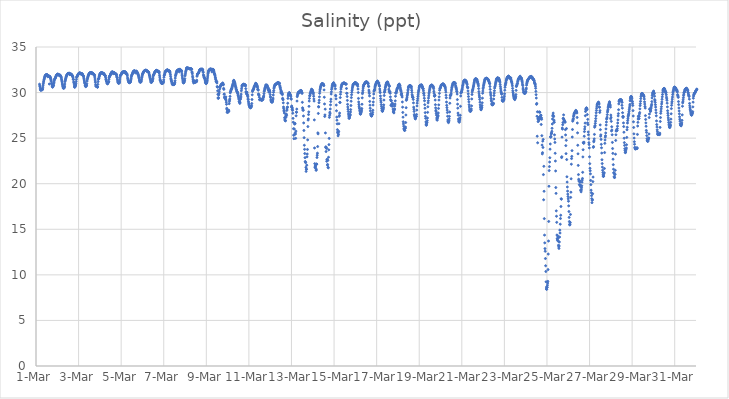
| Category | Salinity (ppt) |
|---|---|
| 44621.166666666664 | 30.92 |
| 44621.177083333336 | 30.74 |
| 44621.1875 | 30.64 |
| 44621.197916666664 | 30.49 |
| 44621.208333333336 | 30.33 |
| 44621.21875 | 30.26 |
| 44621.229166666664 | 30.3 |
| 44621.239583333336 | 30.27 |
| 44621.25 | 30.3 |
| 44621.260416666664 | 30.31 |
| 44621.270833333336 | 30.4 |
| 44621.28125 | 30.34 |
| 44621.291666666664 | 30.35 |
| 44621.302083333336 | 30.31 |
| 44621.3125 | 30.41 |
| 44621.322916666664 | 30.6 |
| 44621.333333333336 | 30.81 |
| 44621.34375 | 30.98 |
| 44621.354166666664 | 31.15 |
| 44621.364583333336 | 31.27 |
| 44621.375 | 31.4 |
| 44621.385416666664 | 31.49 |
| 44621.395833333336 | 31.59 |
| 44621.40625 | 31.69 |
| 44621.416666666664 | 31.77 |
| 44621.427083333336 | 31.82 |
| 44621.4375 | 31.86 |
| 44621.447916666664 | 31.91 |
| 44621.458333333336 | 31.93 |
| 44621.46875 | 31.94 |
| 44621.479166666664 | 31.95 |
| 44621.489583333336 | 31.95 |
| 44621.5 | 31.95 |
| 44621.510416666664 | 31.95 |
| 44621.520833333336 | 31.94 |
| 44621.53125 | 31.95 |
| 44621.541666666664 | 31.91 |
| 44621.552083333336 | 31.74 |
| 44621.5625 | 31.83 |
| 44621.572916666664 | 31.81 |
| 44621.583333333336 | 31.84 |
| 44621.59375 | 31.81 |
| 44621.604166666664 | 31.82 |
| 44621.614583333336 | 31.78 |
| 44621.625 | 30.94 |
| 44621.635416666664 | 31.79 |
| 44621.645833333336 | 31.76 |
| 44621.65625 | 31.74 |
| 44621.666666666664 | 31.67 |
| 44621.677083333336 | 31.61 |
| 44621.6875 | 31.55 |
| 44621.697916666664 | 31.44 |
| 44621.708333333336 | 31.35 |
| 44621.71875 | 31.22 |
| 44621.729166666664 | 31.01 |
| 44621.739583333336 | 30.99 |
| 44621.75 | 30.85 |
| 44621.760416666664 | 30.71 |
| 44621.770833333336 | 30.64 |
| 44621.78125 | 30.59 |
| 44621.791666666664 | 30.66 |
| 44621.802083333336 | 30.74 |
| 44621.8125 | 30.75 |
| 44621.822916666664 | 30.79 |
| 44621.833333333336 | 30.97 |
| 44621.84375 | 31.1 |
| 44621.854166666664 | 31.27 |
| 44621.864583333336 | 31.39 |
| 44621.875 | 31.46 |
| 44621.885416666664 | 31.5 |
| 44621.895833333336 | 31.56 |
| 44621.90625 | 31.6 |
| 44621.916666666664 | 31.65 |
| 44621.927083333336 | 31.72 |
| 44621.9375 | 31.76 |
| 44621.947916666664 | 31.83 |
| 44621.958333333336 | 31.88 |
| 44621.96875 | 31.92 |
| 44621.979166666664 | 31.95 |
| 44621.989583333336 | 31.98 |
| 44622.0 | 32 |
| 44622.010416666664 | 32.01 |
| 44622.020833333336 | 32.01 |
| 44622.03125 | 32.01 |
| 44622.041666666664 | 32.01 |
| 44622.052083333336 | 31.94 |
| 44622.0625 | 31.95 |
| 44622.072916666664 | 31.95 |
| 44622.083333333336 | 31.92 |
| 44622.09375 | 31.92 |
| 44622.104166666664 | 31.91 |
| 44622.114583333336 | 31.89 |
| 44622.125 | 31.91 |
| 44622.135416666664 | 31.91 |
| 44622.145833333336 | 31.85 |
| 44622.15625 | 31.81 |
| 44622.166666666664 | 31.76 |
| 44622.177083333336 | 31.72 |
| 44622.1875 | 31.63 |
| 44622.197916666664 | 31.48 |
| 44622.208333333336 | 31.36 |
| 44622.21875 | 31.22 |
| 44622.229166666664 | 31.06 |
| 44622.239583333336 | 30.92 |
| 44622.25 | 30.81 |
| 44622.260416666664 | 30.64 |
| 44622.270833333336 | 30.61 |
| 44622.28125 | 30.49 |
| 44622.291666666664 | 30.48 |
| 44622.302083333336 | 30.5 |
| 44622.3125 | 30.61 |
| 44622.322916666664 | 30.5 |
| 44622.333333333336 | 30.59 |
| 44622.34375 | 30.7 |
| 44622.354166666664 | 30.94 |
| 44622.364583333336 | 31.2 |
| 44622.375 | 31.33 |
| 44622.385416666664 | 31.44 |
| 44622.395833333336 | 31.55 |
| 44622.40625 | 31.64 |
| 44622.416666666664 | 31.73 |
| 44622.427083333336 | 31.8 |
| 44622.4375 | 31.86 |
| 44622.447916666664 | 31.92 |
| 44622.458333333336 | 31.97 |
| 44622.46875 | 32.01 |
| 44622.479166666664 | 32.04 |
| 44622.489583333336 | 32.07 |
| 44622.5 | 32.09 |
| 44622.510416666664 | 32.09 |
| 44622.520833333336 | 32.1 |
| 44622.53125 | 32.1 |
| 44622.541666666664 | 32.1 |
| 44622.552083333336 | 32.11 |
| 44622.5625 | 32.11 |
| 44622.572916666664 | 32.11 |
| 44622.583333333336 | 31.98 |
| 44622.59375 | 31.97 |
| 44622.604166666664 | 32.03 |
| 44622.614583333336 | 32.03 |
| 44622.625 | 32.01 |
| 44622.635416666664 | 32.04 |
| 44622.645833333336 | 32 |
| 44622.65625 | 32.02 |
| 44622.666666666664 | 31.97 |
| 44622.677083333336 | 31.96 |
| 44622.6875 | 31.93 |
| 44622.697916666664 | 31.86 |
| 44622.708333333336 | 31.84 |
| 44622.71875 | 31.8 |
| 44622.729166666664 | 31.73 |
| 44622.739583333336 | 31.62 |
| 44622.75 | 31.46 |
| 44622.760416666664 | 31.42 |
| 44622.770833333336 | 31.17 |
| 44622.78125 | 31.07 |
| 44622.791666666664 | 30.94 |
| 44622.802083333336 | 30.72 |
| 44622.8125 | 30.61 |
| 44622.822916666664 | 30.58 |
| 44622.833333333336 | 30.67 |
| 44622.84375 | 30.79 |
| 44622.854166666664 | 30.73 |
| 44622.864583333336 | 30.84 |
| 44622.875 | 30.98 |
| 44622.885416666664 | 31.2 |
| 44622.895833333336 | 31.43 |
| 44622.90625 | 31.64 |
| 44622.916666666664 | 31.73 |
| 44622.927083333336 | 31.77 |
| 44622.9375 | 31.81 |
| 44622.947916666664 | 31.87 |
| 44622.958333333336 | 31.9 |
| 44622.96875 | 31.94 |
| 44622.979166666664 | 32 |
| 44622.989583333336 | 32.05 |
| 44623.0 | 32.07 |
| 44623.010416666664 | 32.1 |
| 44623.020833333336 | 32.12 |
| 44623.03125 | 32.13 |
| 44623.041666666664 | 32.14 |
| 44623.052083333336 | 32.15 |
| 44623.0625 | 32.15 |
| 44623.072916666664 | 32.16 |
| 44623.083333333336 | 32.1 |
| 44623.09375 | 32.07 |
| 44623.104166666664 | 32.05 |
| 44623.114583333336 | 32.06 |
| 44623.125 | 32.09 |
| 44623.135416666664 | 32.04 |
| 44623.145833333336 | 32.02 |
| 44623.15625 | 32.07 |
| 44623.166666666664 | 32.05 |
| 44623.177083333336 | 32.06 |
| 44623.1875 | 31.92 |
| 44623.197916666664 | 31.89 |
| 44623.208333333336 | 31.88 |
| 44623.21875 | 31.87 |
| 44623.229166666664 | 31.81 |
| 44623.239583333336 | 31.7 |
| 44623.25 | 31.53 |
| 44623.260416666664 | 31.39 |
| 44623.270833333336 | 31.27 |
| 44623.28125 | 31.13 |
| 44623.291666666664 | 31.03 |
| 44623.302083333336 | 30.96 |
| 44623.3125 | 30.79 |
| 44623.322916666664 | 30.71 |
| 44623.333333333336 | 30.65 |
| 44623.34375 | 30.71 |
| 44623.354166666664 | 30.78 |
| 44623.364583333336 | 30.71 |
| 44623.375 | 30.81 |
| 44623.385416666664 | 30.97 |
| 44623.395833333336 | 31.25 |
| 44623.40625 | 31.4 |
| 44623.416666666664 | 31.53 |
| 44623.427083333336 | 31.64 |
| 44623.4375 | 31.73 |
| 44623.447916666664 | 31.8 |
| 44623.458333333336 | 31.88 |
| 44623.46875 | 31.94 |
| 44623.479166666664 | 31.99 |
| 44623.489583333336 | 32.05 |
| 44623.5 | 32.08 |
| 44623.510416666664 | 32.11 |
| 44623.520833333336 | 32.14 |
| 44623.53125 | 32.16 |
| 44623.541666666664 | 32.17 |
| 44623.552083333336 | 32.18 |
| 44623.5625 | 32.19 |
| 44623.572916666664 | 32.19 |
| 44623.583333333336 | 32.2 |
| 44623.59375 | 32.2 |
| 44623.604166666664 | 32.13 |
| 44623.614583333336 | 32.08 |
| 44623.625 | 32.15 |
| 44623.635416666664 | 32.14 |
| 44623.645833333336 | 32.13 |
| 44623.65625 | 32.11 |
| 44623.666666666664 | 32.13 |
| 44623.677083333336 | 32.08 |
| 44623.6875 | 32.04 |
| 44623.697916666664 | 32 |
| 44623.708333333336 | 31.98 |
| 44623.71875 | 31.98 |
| 44623.729166666664 | 31.99 |
| 44623.739583333336 | 31.95 |
| 44623.75 | 31.85 |
| 44623.760416666664 | 31.7 |
| 44623.770833333336 | 31.49 |
| 44623.78125 | 31.28 |
| 44623.791666666664 | 31.1 |
| 44623.802083333336 | 30.86 |
| 44623.8125 | 30.73 |
| 44623.822916666664 | 30.7 |
| 44623.833333333336 | 30.67 |
| 44623.84375 | 30.69 |
| 44623.854166666664 | 30.69 |
| 44623.864583333336 | 30.7 |
| 44623.875 | 30.63 |
| 44623.885416666664 | 30.58 |
| 44623.895833333336 | 30.62 |
| 44623.90625 | 30.9 |
| 44623.916666666664 | 31.2 |
| 44623.927083333336 | 31.44 |
| 44623.9375 | 31.52 |
| 44623.947916666664 | 31.56 |
| 44623.958333333336 | 31.61 |
| 44623.96875 | 31.76 |
| 44623.979166666664 | 31.85 |
| 44623.989583333336 | 31.95 |
| 44624.0 | 32.02 |
| 44624.010416666664 | 32.06 |
| 44624.020833333336 | 32.1 |
| 44624.03125 | 32.13 |
| 44624.041666666664 | 32.15 |
| 44624.052083333336 | 32.16 |
| 44624.0625 | 32.17 |
| 44624.072916666664 | 32.17 |
| 44624.083333333336 | 32.18 |
| 44624.09375 | 32.18 |
| 44624.104166666664 | 32.19 |
| 44624.114583333336 | 32.08 |
| 44624.125 | 32.12 |
| 44624.135416666664 | 32.1 |
| 44624.145833333336 | 32.09 |
| 44624.15625 | 32.09 |
| 44624.166666666664 | 32.1 |
| 44624.177083333336 | 32.11 |
| 44624.1875 | 32.07 |
| 44624.197916666664 | 32.03 |
| 44624.208333333336 | 31.98 |
| 44624.21875 | 31.94 |
| 44624.229166666664 | 31.91 |
| 44624.239583333336 | 31.89 |
| 44624.25 | 31.87 |
| 44624.260416666664 | 31.83 |
| 44624.270833333336 | 31.67 |
| 44624.28125 | 31.49 |
| 44624.291666666664 | 31.43 |
| 44624.302083333336 | 31.3 |
| 44624.3125 | 31.22 |
| 44624.322916666664 | 31.17 |
| 44624.333333333336 | 31.05 |
| 44624.34375 | 31.02 |
| 44624.354166666664 | 30.98 |
| 44624.364583333336 | 30.96 |
| 44624.375 | 31.09 |
| 44624.385416666664 | 31.05 |
| 44624.395833333336 | 31.11 |
| 44624.40625 | 31.16 |
| 44624.416666666664 | 31.22 |
| 44624.427083333336 | 31.46 |
| 44624.4375 | 31.64 |
| 44624.447916666664 | 31.72 |
| 44624.458333333336 | 31.79 |
| 44624.46875 | 31.84 |
| 44624.479166666664 | 31.85 |
| 44624.489583333336 | 31.91 |
| 44624.5 | 31.99 |
| 44624.510416666664 | 32.06 |
| 44624.520833333336 | 32.08 |
| 44624.53125 | 32.15 |
| 44624.541666666664 | 32.17 |
| 44624.552083333336 | 32.24 |
| 44624.5625 | 32.24 |
| 44624.572916666664 | 32.22 |
| 44624.583333333336 | 32.25 |
| 44624.59375 | 32.26 |
| 44624.604166666664 | 32.24 |
| 44624.614583333336 | 32.25 |
| 44624.625 | 32.07 |
| 44624.635416666664 | 32.15 |
| 44624.645833333336 | 32.19 |
| 44624.65625 | 32.19 |
| 44624.666666666664 | 32.16 |
| 44624.677083333336 | 32.16 |
| 44624.6875 | 32.17 |
| 44624.697916666664 | 32.13 |
| 44624.708333333336 | 32.11 |
| 44624.71875 | 32.1 |
| 44624.729166666664 | 32.05 |
| 44624.739583333336 | 32.04 |
| 44624.75 | 32.05 |
| 44624.760416666664 | 32.02 |
| 44624.770833333336 | 32.01 |
| 44624.78125 | 31.96 |
| 44624.791666666664 | 31.79 |
| 44624.802083333336 | 31.69 |
| 44624.8125 | 31.64 |
| 44624.822916666664 | 31.46 |
| 44624.833333333336 | 31.29 |
| 44624.84375 | 31.17 |
| 44624.854166666664 | 31.1 |
| 44624.864583333336 | 31.05 |
| 44624.875 | 31.03 |
| 44624.885416666664 | 31.03 |
| 44624.895833333336 | 31.18 |
| 44624.90625 | 31.04 |
| 44624.916666666664 | 31.09 |
| 44624.927083333336 | 31.19 |
| 44624.9375 | 31.39 |
| 44624.947916666664 | 31.61 |
| 44624.958333333336 | 31.83 |
| 44624.96875 | 31.89 |
| 44624.979166666664 | 31.9 |
| 44624.989583333336 | 31.94 |
| 44625.0 | 32.01 |
| 44625.010416666664 | 32.02 |
| 44625.020833333336 | 32.09 |
| 44625.03125 | 32.14 |
| 44625.041666666664 | 32.18 |
| 44625.052083333336 | 32.2 |
| 44625.0625 | 32.22 |
| 44625.072916666664 | 32.24 |
| 44625.083333333336 | 32.26 |
| 44625.09375 | 32.27 |
| 44625.104166666664 | 32.28 |
| 44625.114583333336 | 32.29 |
| 44625.125 | 32.29 |
| 44625.135416666664 | 32.28 |
| 44625.145833333336 | 32.29 |
| 44625.15625 | 32.18 |
| 44625.166666666664 | 32.21 |
| 44625.177083333336 | 32.29 |
| 44625.1875 | 32.26 |
| 44625.197916666664 | 32.24 |
| 44625.208333333336 | 32.23 |
| 44625.21875 | 32.18 |
| 44625.229166666664 | 32.11 |
| 44625.239583333336 | 32.05 |
| 44625.25 | 32.04 |
| 44625.260416666664 | 32.08 |
| 44625.270833333336 | 32.03 |
| 44625.28125 | 31.95 |
| 44625.291666666664 | 31.83 |
| 44625.302083333336 | 31.61 |
| 44625.3125 | 31.5 |
| 44625.322916666664 | 31.39 |
| 44625.333333333336 | 31.31 |
| 44625.34375 | 31.23 |
| 44625.354166666664 | 31.17 |
| 44625.364583333336 | 31.13 |
| 44625.375 | 31.07 |
| 44625.385416666664 | 31.09 |
| 44625.395833333336 | 31.11 |
| 44625.40625 | 31.17 |
| 44625.416666666664 | 31.12 |
| 44625.427083333336 | 31.14 |
| 44625.4375 | 31.19 |
| 44625.447916666664 | 31.29 |
| 44625.458333333336 | 31.41 |
| 44625.46875 | 31.57 |
| 44625.479166666664 | 31.73 |
| 44625.489583333336 | 31.84 |
| 44625.5 | 31.92 |
| 44625.510416666664 | 31.97 |
| 44625.520833333336 | 32.03 |
| 44625.53125 | 32.09 |
| 44625.541666666664 | 32.14 |
| 44625.552083333336 | 32.21 |
| 44625.5625 | 32.26 |
| 44625.572916666664 | 32.3 |
| 44625.583333333336 | 32.33 |
| 44625.59375 | 32.35 |
| 44625.604166666664 | 32.37 |
| 44625.614583333336 | 32.38 |
| 44625.625 | 32.38 |
| 44625.635416666664 | 32.37 |
| 44625.645833333336 | 32.36 |
| 44625.65625 | 32.32 |
| 44625.666666666664 | 32.16 |
| 44625.677083333336 | 32.3 |
| 44625.6875 | 32.33 |
| 44625.697916666664 | 32.33 |
| 44625.708333333336 | 32.35 |
| 44625.71875 | 32.33 |
| 44625.729166666664 | 32.31 |
| 44625.739583333336 | 32.27 |
| 44625.75 | 32.21 |
| 44625.760416666664 | 32.18 |
| 44625.770833333336 | 32.09 |
| 44625.78125 | 32.08 |
| 44625.791666666664 | 32 |
| 44625.802083333336 | 31.93 |
| 44625.8125 | 31.88 |
| 44625.822916666664 | 31.75 |
| 44625.833333333336 | 31.64 |
| 44625.84375 | 31.56 |
| 44625.854166666664 | 31.38 |
| 44625.864583333336 | 31.36 |
| 44625.875 | 31.19 |
| 44625.885416666664 | 31.19 |
| 44625.895833333336 | 31.13 |
| 44625.90625 | 31.14 |
| 44625.916666666664 | 31.27 |
| 44625.927083333336 | 31.18 |
| 44625.9375 | 31.18 |
| 44625.947916666664 | 31.3 |
| 44625.958333333336 | 31.46 |
| 44625.96875 | 31.63 |
| 44625.979166666664 | 31.74 |
| 44625.989583333336 | 31.89 |
| 44626.0 | 32 |
| 44626.010416666664 | 32.05 |
| 44626.020833333336 | 32.1 |
| 44626.03125 | 32.16 |
| 44626.041666666664 | 32.2 |
| 44626.052083333336 | 32.25 |
| 44626.0625 | 32.3 |
| 44626.072916666664 | 32.34 |
| 44626.083333333336 | 32.37 |
| 44626.09375 | 32.39 |
| 44626.104166666664 | 32.41 |
| 44626.114583333336 | 32.42 |
| 44626.125 | 32.43 |
| 44626.135416666664 | 32.43 |
| 44626.145833333336 | 32.44 |
| 44626.15625 | 32.45 |
| 44626.166666666664 | 32.46 |
| 44626.177083333336 | 32.44 |
| 44626.1875 | 32.37 |
| 44626.197916666664 | 32.36 |
| 44626.208333333336 | 32.35 |
| 44626.21875 | 32.37 |
| 44626.229166666664 | 32.37 |
| 44626.239583333336 | 32.35 |
| 44626.25 | 32.34 |
| 44626.260416666664 | 32.31 |
| 44626.270833333336 | 32.29 |
| 44626.28125 | 32.24 |
| 44626.291666666664 | 32.21 |
| 44626.302083333336 | 32.15 |
| 44626.3125 | 32.04 |
| 44626.322916666664 | 31.93 |
| 44626.333333333336 | 31.88 |
| 44626.34375 | 31.74 |
| 44626.354166666664 | 31.64 |
| 44626.364583333336 | 31.52 |
| 44626.375 | 31.45 |
| 44626.385416666664 | 31.3 |
| 44626.395833333336 | 31.2 |
| 44626.40625 | 31.12 |
| 44626.416666666664 | 31.12 |
| 44626.427083333336 | 31.12 |
| 44626.4375 | 31.21 |
| 44626.447916666664 | 31.2 |
| 44626.458333333336 | 31.24 |
| 44626.46875 | 31.32 |
| 44626.479166666664 | 31.44 |
| 44626.489583333336 | 31.54 |
| 44626.5 | 31.72 |
| 44626.510416666664 | 31.88 |
| 44626.520833333336 | 31.92 |
| 44626.53125 | 31.95 |
| 44626.541666666664 | 32.02 |
| 44626.552083333336 | 32.09 |
| 44626.5625 | 32.15 |
| 44626.572916666664 | 32.21 |
| 44626.583333333336 | 32.25 |
| 44626.59375 | 32.29 |
| 44626.604166666664 | 32.32 |
| 44626.614583333336 | 32.36 |
| 44626.625 | 32.38 |
| 44626.635416666664 | 32.4 |
| 44626.645833333336 | 32.42 |
| 44626.65625 | 32.43 |
| 44626.666666666664 | 32.44 |
| 44626.677083333336 | 32.36 |
| 44626.6875 | 32.37 |
| 44626.697916666664 | 32.34 |
| 44626.708333333336 | 32.34 |
| 44626.71875 | 32.36 |
| 44626.729166666664 | 32.34 |
| 44626.739583333336 | 32.35 |
| 44626.75 | 32.32 |
| 44626.760416666664 | 32.23 |
| 44626.770833333336 | 32.3 |
| 44626.78125 | 32.27 |
| 44626.791666666664 | 32.15 |
| 44626.802083333336 | 31.91 |
| 44626.8125 | 31.7 |
| 44626.822916666664 | 31.48 |
| 44626.833333333336 | 31.36 |
| 44626.84375 | 31.33 |
| 44626.854166666664 | 31.27 |
| 44626.864583333336 | 31.16 |
| 44626.875 | 31.13 |
| 44626.885416666664 | 31.03 |
| 44626.895833333336 | 31.02 |
| 44626.90625 | 31.02 |
| 44626.916666666664 | 31.02 |
| 44626.927083333336 | 31.02 |
| 44626.9375 | 31.04 |
| 44626.947916666664 | 31.07 |
| 44626.958333333336 | 31.02 |
| 44626.96875 | 31.06 |
| 44626.979166666664 | 31.13 |
| 44626.989583333336 | 31.2 |
| 44627.0 | 31.39 |
| 44627.010416666664 | 31.68 |
| 44627.020833333336 | 31.87 |
| 44627.03125 | 31.94 |
| 44627.041666666664 | 32.01 |
| 44627.052083333336 | 32.13 |
| 44627.0625 | 32.22 |
| 44627.072916666664 | 32.29 |
| 44627.083333333336 | 32.33 |
| 44627.09375 | 32.35 |
| 44627.104166666664 | 32.37 |
| 44627.114583333336 | 32.39 |
| 44627.125 | 32.41 |
| 44627.135416666664 | 32.44 |
| 44627.145833333336 | 32.46 |
| 44627.15625 | 32.47 |
| 44627.166666666664 | 32.48 |
| 44627.177083333336 | 32.48 |
| 44627.1875 | 32.48 |
| 44627.197916666664 | 32.45 |
| 44627.208333333336 | 32.37 |
| 44627.21875 | 32.39 |
| 44627.229166666664 | 32.36 |
| 44627.239583333336 | 32.37 |
| 44627.25 | 32.37 |
| 44627.260416666664 | 32.38 |
| 44627.270833333336 | 32.36 |
| 44627.28125 | 32.34 |
| 44627.291666666664 | 32.26 |
| 44627.302083333336 | 32.14 |
| 44627.3125 | 31.97 |
| 44627.322916666664 | 31.78 |
| 44627.333333333336 | 31.57 |
| 44627.34375 | 31.45 |
| 44627.354166666664 | 31.36 |
| 44627.364583333336 | 31.25 |
| 44627.375 | 31.17 |
| 44627.385416666664 | 31.06 |
| 44627.395833333336 | 30.97 |
| 44627.40625 | 30.9 |
| 44627.416666666664 | 30.88 |
| 44627.427083333336 | 30.88 |
| 44627.4375 | 30.88 |
| 44627.447916666664 | 30.87 |
| 44627.458333333336 | 30.89 |
| 44627.46875 | 30.92 |
| 44627.479166666664 | 30.9 |
| 44627.489583333336 | 30.89 |
| 44627.5 | 30.94 |
| 44627.510416666664 | 31.02 |
| 44627.520833333336 | 31.13 |
| 44627.53125 | 31.3 |
| 44627.541666666664 | 31.59 |
| 44627.552083333336 | 31.83 |
| 44627.5625 | 31.92 |
| 44627.572916666664 | 32 |
| 44627.583333333336 | 32.09 |
| 44627.59375 | 32.19 |
| 44627.604166666664 | 32.28 |
| 44627.614583333336 | 32.35 |
| 44627.625 | 32.4 |
| 44627.635416666664 | 32.41 |
| 44627.645833333336 | 32.43 |
| 44627.65625 | 32.45 |
| 44627.666666666664 | 32.47 |
| 44627.677083333336 | 32.48 |
| 44627.6875 | 32.49 |
| 44627.697916666664 | 32.5 |
| 44627.708333333336 | 32.53 |
| 44627.71875 | 32.5 |
| 44627.729166666664 | 32.27 |
| 44627.739583333336 | 32.42 |
| 44627.75 | 32.44 |
| 44627.760416666664 | 32.57 |
| 44627.770833333336 | 32.49 |
| 44627.78125 | 32.49 |
| 44627.791666666664 | 32.44 |
| 44627.802083333336 | 32.45 |
| 44627.8125 | 32.45 |
| 44627.822916666664 | 32.42 |
| 44627.833333333336 | 32.39 |
| 44627.84375 | 32.27 |
| 44627.854166666664 | 32.04 |
| 44627.864583333336 | 31.86 |
| 44627.875 | 31.7 |
| 44627.885416666664 | 31.52 |
| 44627.895833333336 | 31.37 |
| 44627.90625 | 31.19 |
| 44627.916666666664 | 31.1 |
| 44627.927083333336 | 31.07 |
| 44627.9375 | 31.07 |
| 44627.947916666664 | 31.1 |
| 44627.958333333336 | 31.16 |
| 44627.96875 | 31.25 |
| 44627.979166666664 | 31.34 |
| 44627.989583333336 | 31.52 |
| 44628.0 | 31.83 |
| 44628.010416666664 | 31.95 |
| 44628.020833333336 | 32.13 |
| 44628.03125 | 32.28 |
| 44628.041666666664 | 32.38 |
| 44628.052083333336 | 32.47 |
| 44628.0625 | 32.59 |
| 44628.072916666664 | 32.7 |
| 44628.083333333336 | 32.71 |
| 44628.09375 | 32.7 |
| 44628.104166666664 | 32.69 |
| 44628.114583333336 | 32.69 |
| 44628.125 | 32.68 |
| 44628.135416666664 | 32.68 |
| 44628.145833333336 | 32.67 |
| 44628.15625 | 32.67 |
| 44628.166666666664 | 32.66 |
| 44628.177083333336 | 32.65 |
| 44628.1875 | 32.64 |
| 44628.197916666664 | 32.64 |
| 44628.208333333336 | 32.63 |
| 44628.21875 | 32.63 |
| 44628.229166666664 | 32.59 |
| 44628.239583333336 | 32.59 |
| 44628.25 | 32.6 |
| 44628.260416666664 | 32.6 |
| 44628.270833333336 | 32.61 |
| 44628.28125 | 32.6 |
| 44628.291666666664 | 32.6 |
| 44628.302083333336 | 32.6 |
| 44628.3125 | 32.54 |
| 44628.322916666664 | 32.27 |
| 44628.333333333336 | 32.22 |
| 44628.34375 | 32.06 |
| 44628.354166666664 | 31.8 |
| 44628.364583333336 | 31.62 |
| 44628.375 | 31.4 |
| 44628.385416666664 | 31.25 |
| 44628.395833333336 | 31.21 |
| 44628.40625 | 31.05 |
| 44628.416666666664 | 31.08 |
| 44628.427083333336 | 31.18 |
| 44628.4375 | 31.2 |
| 44628.447916666664 | 31.25 |
| 44628.458333333336 | 31.28 |
| 44628.46875 | 31.19 |
| 44628.479166666664 | 31.16 |
| 44628.489583333336 | 31.14 |
| 44628.5 | 31.14 |
| 44628.510416666664 | 31.2 |
| 44628.520833333336 | 31.21 |
| 44628.53125 | 31.22 |
| 44628.541666666664 | 31.2 |
| 44628.552083333336 | 31.36 |
| 44628.5625 | 31.79 |
| 44628.572916666664 | 31.91 |
| 44628.583333333336 | 32.02 |
| 44628.59375 | 32.07 |
| 44628.604166666664 | 32.08 |
| 44628.614583333336 | 32.1 |
| 44628.625 | 32.1 |
| 44628.635416666664 | 32.15 |
| 44628.645833333336 | 32.21 |
| 44628.65625 | 32.29 |
| 44628.666666666664 | 32.35 |
| 44628.677083333336 | 32.41 |
| 44628.6875 | 32.48 |
| 44628.697916666664 | 32.51 |
| 44628.708333333336 | 32.53 |
| 44628.71875 | 32.54 |
| 44628.729166666664 | 32.55 |
| 44628.739583333336 | 32.56 |
| 44628.75 | 32.53 |
| 44628.760416666664 | 32.51 |
| 44628.770833333336 | 32.53 |
| 44628.78125 | 32.57 |
| 44628.791666666664 | 32.57 |
| 44628.802083333336 | 32.57 |
| 44628.8125 | 32.55 |
| 44628.822916666664 | 32.54 |
| 44628.833333333336 | 32.49 |
| 44628.84375 | 32.34 |
| 44628.854166666664 | 32.2 |
| 44628.864583333336 | 31.94 |
| 44628.875 | 31.87 |
| 44628.885416666664 | 31.75 |
| 44628.895833333336 | 31.69 |
| 44628.90625 | 31.63 |
| 44628.916666666664 | 31.57 |
| 44628.927083333336 | 31.52 |
| 44628.9375 | 31.39 |
| 44628.947916666664 | 31.27 |
| 44628.958333333336 | 31.13 |
| 44628.96875 | 31.08 |
| 44628.979166666664 | 31.04 |
| 44628.989583333336 | 31 |
| 44629.0 | 30.99 |
| 44629.010416666664 | 31.06 |
| 44629.020833333336 | 31.13 |
| 44629.03125 | 31.19 |
| 44629.041666666664 | 31.31 |
| 44629.052083333336 | 31.5 |
| 44629.0625 | 31.71 |
| 44629.072916666664 | 31.92 |
| 44629.083333333336 | 32.11 |
| 44629.09375 | 32.23 |
| 44629.104166666664 | 32.35 |
| 44629.114583333336 | 32.41 |
| 44629.125 | 32.45 |
| 44629.135416666664 | 32.49 |
| 44629.145833333336 | 32.51 |
| 44629.15625 | 32.55 |
| 44629.166666666664 | 32.56 |
| 44629.177083333336 | 32.56 |
| 44629.1875 | 32.56 |
| 44629.197916666664 | 32.57 |
| 44629.208333333336 | 32.57 |
| 44629.21875 | 32.58 |
| 44629.229166666664 | 32.57 |
| 44629.239583333336 | 32.52 |
| 44629.25 | 32.53 |
| 44629.260416666664 | 32.28 |
| 44629.270833333336 | 32.5 |
| 44629.28125 | 32.53 |
| 44629.291666666664 | 32.54 |
| 44629.302083333336 | 32.53 |
| 44629.3125 | 32.53 |
| 44629.322916666664 | 32.54 |
| 44629.333333333336 | 32.49 |
| 44629.34375 | 32.43 |
| 44629.354166666664 | 32.33 |
| 44629.364583333336 | 32.2 |
| 44629.375 | 32.09 |
| 44629.385416666664 | 32.04 |
| 44629.395833333336 | 31.97 |
| 44629.40625 | 31.87 |
| 44629.416666666664 | 31.71 |
| 44629.427083333336 | 31.62 |
| 44629.4375 | 31.48 |
| 44629.447916666664 | 31.39 |
| 44629.458333333336 | 31.21 |
| 44629.46875 | 31.27 |
| 44629.479166666664 | 31.18 |
| 44629.489583333336 | 31.2 |
| 44629.5 | 31.05 |
| 44629.510416666664 | 30.66 |
| 44629.520833333336 | 30.59 |
| 44629.53125 | 30.19 |
| 44629.541666666664 | 29.81 |
| 44629.552083333336 | 29.42 |
| 44629.5625 | 29.36 |
| 44629.572916666664 | 29.44 |
| 44629.583333333336 | 29.74 |
| 44629.59375 | 29.89 |
| 44629.604166666664 | 30.08 |
| 44629.614583333336 | 30.32 |
| 44629.625 | 30.63 |
| 44629.635416666664 | 30.65 |
| 44629.645833333336 | 30.51 |
| 44629.65625 | 30.67 |
| 44629.666666666664 | 30.7 |
| 44629.677083333336 | 30.79 |
| 44629.6875 | 30.82 |
| 44629.697916666664 | 30.88 |
| 44629.708333333336 | 30.9 |
| 44629.71875 | 30.9 |
| 44629.729166666664 | 30.91 |
| 44629.739583333336 | 30.94 |
| 44629.75 | 30.92 |
| 44629.760416666664 | 31 |
| 44629.770833333336 | 31.06 |
| 44629.78125 | 30.97 |
| 44629.791666666664 | 30.84 |
| 44629.802083333336 | 30.89 |
| 44629.8125 | 30.46 |
| 44629.822916666664 | 30.35 |
| 44629.833333333336 | 29.81 |
| 44629.84375 | 29.84 |
| 44629.854166666664 | 29.51 |
| 44629.864583333336 | 29.47 |
| 44629.875 | 29.37 |
| 44629.885416666664 | 29.37 |
| 44629.895833333336 | 29.46 |
| 44629.90625 | 29.27 |
| 44629.916666666664 | 29.53 |
| 44629.927083333336 | 29.17 |
| 44629.9375 | 28.95 |
| 44629.947916666664 | 28.71 |
| 44629.958333333336 | 28.28 |
| 44629.96875 | 28.15 |
| 44629.979166666664 | 27.82 |
| 44629.989583333336 | 27.92 |
| 44630.0 | 28.04 |
| 44630.010416666664 | 27.86 |
| 44630.020833333336 | 27.85 |
| 44630.03125 | 27.97 |
| 44630.041666666664 | 27.96 |
| 44630.052083333336 | 28.08 |
| 44630.0625 | 27.97 |
| 44630.072916666664 | 28.78 |
| 44630.083333333336 | 29.02 |
| 44630.09375 | 29.18 |
| 44630.104166666664 | 29.3 |
| 44630.114583333336 | 29.58 |
| 44630.125 | 29.97 |
| 44630.135416666664 | 30.09 |
| 44630.145833333336 | 30.16 |
| 44630.15625 | 30.23 |
| 44630.166666666664 | 30.33 |
| 44630.177083333336 | 30.37 |
| 44630.1875 | 30.4 |
| 44630.197916666664 | 30.47 |
| 44630.208333333336 | 30.56 |
| 44630.21875 | 30.67 |
| 44630.229166666664 | 30.76 |
| 44630.239583333336 | 30.85 |
| 44630.25 | 30.94 |
| 44630.260416666664 | 31.03 |
| 44630.270833333336 | 31.2 |
| 44630.28125 | 31.31 |
| 44630.291666666664 | 31.35 |
| 44630.302083333336 | 31.27 |
| 44630.3125 | 31.19 |
| 44630.322916666664 | 31.14 |
| 44630.333333333336 | 31.08 |
| 44630.34375 | 30.99 |
| 44630.354166666664 | 30.89 |
| 44630.364583333336 | 30.74 |
| 44630.375 | 30.67 |
| 44630.385416666664 | 30.52 |
| 44630.395833333336 | 30.5 |
| 44630.40625 | 30.35 |
| 44630.416666666664 | 30.32 |
| 44630.427083333336 | 30.18 |
| 44630.4375 | 30.09 |
| 44630.447916666664 | 30.1 |
| 44630.458333333336 | 30.04 |
| 44630.46875 | 29.97 |
| 44630.479166666664 | 29.88 |
| 44630.489583333336 | 29.74 |
| 44630.5 | 29.66 |
| 44630.510416666664 | 29.53 |
| 44630.520833333336 | 29.39 |
| 44630.53125 | 29.24 |
| 44630.541666666664 | 29.01 |
| 44630.552083333336 | 28.97 |
| 44630.5625 | 28.98 |
| 44630.572916666664 | 28.81 |
| 44630.583333333336 | 28.93 |
| 44630.59375 | 29.23 |
| 44630.604166666664 | 29.31 |
| 44630.614583333336 | 29.45 |
| 44630.625 | 29.61 |
| 44630.635416666664 | 29.83 |
| 44630.645833333336 | 30.2 |
| 44630.65625 | 30.41 |
| 44630.666666666664 | 30.61 |
| 44630.677083333336 | 30.76 |
| 44630.6875 | 30.81 |
| 44630.697916666664 | 30.86 |
| 44630.708333333336 | 30.83 |
| 44630.71875 | 30.85 |
| 44630.729166666664 | 30.83 |
| 44630.739583333336 | 30.84 |
| 44630.75 | 30.89 |
| 44630.760416666664 | 30.94 |
| 44630.770833333336 | 30.85 |
| 44630.78125 | 30.84 |
| 44630.791666666664 | 30.86 |
| 44630.802083333336 | 30.85 |
| 44630.8125 | 30.86 |
| 44630.822916666664 | 30.85 |
| 44630.833333333336 | 30.82 |
| 44630.84375 | 30.73 |
| 44630.854166666664 | 30.43 |
| 44630.864583333336 | 30.11 |
| 44630.875 | 30 |
| 44630.885416666664 | 29.86 |
| 44630.895833333336 | 30.03 |
| 44630.90625 | 30.03 |
| 44630.916666666664 | 29.83 |
| 44630.927083333336 | 29.77 |
| 44630.9375 | 29.66 |
| 44630.947916666664 | 29.54 |
| 44630.958333333336 | 29.3 |
| 44630.96875 | 29.22 |
| 44630.979166666664 | 29 |
| 44630.989583333336 | 28.84 |
| 44631.0 | 28.69 |
| 44631.010416666664 | 28.6 |
| 44631.020833333336 | 28.52 |
| 44631.03125 | 28.46 |
| 44631.041666666664 | 28.43 |
| 44631.052083333336 | 28.4 |
| 44631.0625 | 28.39 |
| 44631.072916666664 | 28.34 |
| 44631.083333333336 | 28.33 |
| 44631.09375 | 28.42 |
| 44631.104166666664 | 28.43 |
| 44631.114583333336 | 28.44 |
| 44631.125 | 28.58 |
| 44631.135416666664 | 28.8 |
| 44631.145833333336 | 29.24 |
| 44631.15625 | 29.75 |
| 44631.166666666664 | 30.12 |
| 44631.177083333336 | 30.21 |
| 44631.1875 | 30.27 |
| 44631.197916666664 | 30.29 |
| 44631.208333333336 | 30.34 |
| 44631.21875 | 30.38 |
| 44631.229166666664 | 30.48 |
| 44631.239583333336 | 30.57 |
| 44631.25 | 30.63 |
| 44631.260416666664 | 30.67 |
| 44631.270833333336 | 30.73 |
| 44631.28125 | 30.76 |
| 44631.291666666664 | 30.84 |
| 44631.302083333336 | 30.91 |
| 44631.3125 | 31.01 |
| 44631.322916666664 | 31.01 |
| 44631.333333333336 | 31 |
| 44631.34375 | 30.91 |
| 44631.354166666664 | 30.87 |
| 44631.364583333336 | 30.88 |
| 44631.375 | 30.79 |
| 44631.385416666664 | 30.68 |
| 44631.395833333336 | 30.7 |
| 44631.40625 | 30.55 |
| 44631.416666666664 | 30.36 |
| 44631.427083333336 | 30.32 |
| 44631.4375 | 30.26 |
| 44631.447916666664 | 29.85 |
| 44631.458333333336 | 29.76 |
| 44631.46875 | 29.72 |
| 44631.479166666664 | 29.73 |
| 44631.489583333336 | 29.49 |
| 44631.5 | 29.22 |
| 44631.510416666664 | 29.25 |
| 44631.520833333336 | 29.2 |
| 44631.53125 | 29.22 |
| 44631.541666666664 | 29.25 |
| 44631.552083333336 | 29.27 |
| 44631.5625 | 29.23 |
| 44631.572916666664 | 29.18 |
| 44631.583333333336 | 29.2 |
| 44631.59375 | 29.19 |
| 44631.604166666664 | 29.17 |
| 44631.614583333336 | 29.16 |
| 44631.625 | 29.22 |
| 44631.635416666664 | 29.2 |
| 44631.645833333336 | 29.25 |
| 44631.65625 | 29.26 |
| 44631.666666666664 | 29.41 |
| 44631.677083333336 | 29.44 |
| 44631.6875 | 29.56 |
| 44631.697916666664 | 29.63 |
| 44631.708333333336 | 29.88 |
| 44631.71875 | 30.13 |
| 44631.729166666664 | 30.22 |
| 44631.739583333336 | 30.39 |
| 44631.75 | 30.39 |
| 44631.760416666664 | 30.57 |
| 44631.770833333336 | 30.6 |
| 44631.78125 | 30.6 |
| 44631.791666666664 | 30.8 |
| 44631.802083333336 | 30.85 |
| 44631.8125 | 30.75 |
| 44631.822916666664 | 30.61 |
| 44631.833333333336 | 30.78 |
| 44631.84375 | 30.84 |
| 44631.854166666664 | 30.74 |
| 44631.864583333336 | 30.58 |
| 44631.875 | 30.69 |
| 44631.885416666664 | 30.58 |
| 44631.895833333336 | 30.41 |
| 44631.90625 | 30.3 |
| 44631.916666666664 | 30.48 |
| 44631.927083333336 | 30.21 |
| 44631.9375 | 30.05 |
| 44631.947916666664 | 30.24 |
| 44631.958333333336 | 30.16 |
| 44631.96875 | 30.28 |
| 44631.979166666664 | 30.15 |
| 44631.989583333336 | 30.02 |
| 44632.0 | 29.77 |
| 44632.010416666664 | 29.55 |
| 44632.020833333336 | 29.45 |
| 44632.03125 | 29.21 |
| 44632.041666666664 | 29.13 |
| 44632.052083333336 | 29.02 |
| 44632.0625 | 28.99 |
| 44632.072916666664 | 28.96 |
| 44632.083333333336 | 28.97 |
| 44632.09375 | 28.97 |
| 44632.104166666664 | 28.98 |
| 44632.114583333336 | 29.09 |
| 44632.125 | 29.22 |
| 44632.135416666664 | 29.39 |
| 44632.145833333336 | 29.73 |
| 44632.15625 | 30.03 |
| 44632.166666666664 | 30.23 |
| 44632.177083333336 | 30.47 |
| 44632.1875 | 30.59 |
| 44632.197916666664 | 30.66 |
| 44632.208333333336 | 30.75 |
| 44632.21875 | 30.81 |
| 44632.229166666664 | 30.86 |
| 44632.239583333336 | 30.88 |
| 44632.25 | 30.9 |
| 44632.260416666664 | 30.89 |
| 44632.270833333336 | 30.91 |
| 44632.28125 | 30.96 |
| 44632.291666666664 | 30.96 |
| 44632.302083333336 | 30.99 |
| 44632.3125 | 31.03 |
| 44632.322916666664 | 31.04 |
| 44632.333333333336 | 31.04 |
| 44632.34375 | 31.04 |
| 44632.354166666664 | 31.06 |
| 44632.364583333336 | 31.07 |
| 44632.375 | 31.08 |
| 44632.385416666664 | 31.09 |
| 44632.395833333336 | 31.03 |
| 44632.40625 | 31.04 |
| 44632.416666666664 | 31.01 |
| 44632.427083333336 | 31.02 |
| 44632.4375 | 31.02 |
| 44632.447916666664 | 30.79 |
| 44632.458333333336 | 30.69 |
| 44632.46875 | 30.57 |
| 44632.479166666664 | 30.48 |
| 44632.489583333336 | 30.31 |
| 44632.5 | 30.07 |
| 44632.510416666664 | 29.93 |
| 44632.520833333336 | 30.18 |
| 44632.53125 | 30.05 |
| 44632.541666666664 | 30.01 |
| 44632.552083333336 | 29.9 |
| 44632.5625 | 29.88 |
| 44632.572916666664 | 29.77 |
| 44632.583333333336 | 29.37 |
| 44632.59375 | 29.29 |
| 44632.604166666664 | 29.21 |
| 44632.614583333336 | 28.87 |
| 44632.625 | 28.42 |
| 44632.635416666664 | 28.24 |
| 44632.645833333336 | 28.05 |
| 44632.65625 | 27.91 |
| 44632.666666666664 | 27.75 |
| 44632.677083333336 | 27.25 |
| 44632.6875 | 27 |
| 44632.697916666664 | 27.11 |
| 44632.708333333336 | 26.91 |
| 44632.71875 | 26.91 |
| 44632.729166666664 | 27.43 |
| 44632.739583333336 | 27.3 |
| 44632.75 | 27.61 |
| 44632.760416666664 | 27.63 |
| 44632.770833333336 | 27.48 |
| 44632.78125 | 28.04 |
| 44632.791666666664 | 28.19 |
| 44632.802083333336 | 28.37 |
| 44632.8125 | 28.42 |
| 44632.822916666664 | 28.83 |
| 44632.833333333336 | 29.36 |
| 44632.84375 | 29.63 |
| 44632.854166666664 | 29.76 |
| 44632.864583333336 | 29.87 |
| 44632.875 | 29.96 |
| 44632.885416666664 | 29.83 |
| 44632.895833333336 | 29.97 |
| 44632.90625 | 29.98 |
| 44632.916666666664 | 29.94 |
| 44632.927083333336 | 29.79 |
| 44632.9375 | 29.74 |
| 44632.947916666664 | 29.69 |
| 44632.958333333336 | 29.7 |
| 44632.96875 | 29.6 |
| 44632.979166666664 | 29.35 |
| 44632.989583333336 | 29.27 |
| 44633.0 | 28.42 |
| 44633.010416666664 | 28.53 |
| 44633.020833333336 | 28.4 |
| 44633.03125 | 28.16 |
| 44633.041666666664 | 28.3 |
| 44633.052083333336 | 28.05 |
| 44633.0625 | 27.73 |
| 44633.072916666664 | 27.17 |
| 44633.083333333336 | 26.74 |
| 44633.09375 | 26.04 |
| 44633.104166666664 | 25.31 |
| 44633.114583333336 | 24.94 |
| 44633.125 | 25.38 |
| 44633.135416666664 | 26 |
| 44633.145833333336 | 26.54 |
| 44633.15625 | 26.64 |
| 44633.166666666664 | 26.58 |
| 44633.177083333336 | 25.59 |
| 44633.1875 | 25.45 |
| 44633.197916666664 | 24.98 |
| 44633.208333333336 | 25.77 |
| 44633.21875 | 27.45 |
| 44633.229166666664 | 27.85 |
| 44633.239583333336 | 27.84 |
| 44633.25 | 28.19 |
| 44633.260416666664 | 29.07 |
| 44633.270833333336 | 29.55 |
| 44633.28125 | 29.7 |
| 44633.291666666664 | 29.82 |
| 44633.302083333336 | 29.92 |
| 44633.3125 | 29.94 |
| 44633.322916666664 | 30.01 |
| 44633.333333333336 | 30.04 |
| 44633.34375 | 30.08 |
| 44633.354166666664 | 30.04 |
| 44633.364583333336 | 30 |
| 44633.375 | 29.99 |
| 44633.385416666664 | 30.07 |
| 44633.395833333336 | 30.14 |
| 44633.40625 | 30.17 |
| 44633.416666666664 | 30.21 |
| 44633.427083333336 | 30.23 |
| 44633.4375 | 30.16 |
| 44633.447916666664 | 30.24 |
| 44633.458333333336 | 30.21 |
| 44633.46875 | 30.14 |
| 44633.479166666664 | 29.98 |
| 44633.489583333336 | 30.01 |
| 44633.5 | 29.91 |
| 44633.510416666664 | 28.93 |
| 44633.520833333336 | 28.33 |
| 44633.53125 | 28.2 |
| 44633.541666666664 | 28.06 |
| 44633.552083333336 | 28.07 |
| 44633.5625 | 27.43 |
| 44633.572916666664 | 26.67 |
| 44633.583333333336 | 25.84 |
| 44633.59375 | 25.05 |
| 44633.604166666664 | 24.22 |
| 44633.614583333336 | 23.77 |
| 44633.625 | 23.31 |
| 44633.635416666664 | 22.86 |
| 44633.645833333336 | 22.44 |
| 44633.65625 | 22.37 |
| 44633.666666666664 | 22.31 |
| 44633.677083333336 | 21.8 |
| 44633.6875 | 21.35 |
| 44633.697916666664 | 21.59 |
| 44633.708333333336 | 21.58 |
| 44633.71875 | 22.03 |
| 44633.729166666664 | 22.95 |
| 44633.739583333336 | 23.26 |
| 44633.75 | 23.76 |
| 44633.760416666664 | 24.81 |
| 44633.770833333336 | 26.27 |
| 44633.78125 | 26.98 |
| 44633.791666666664 | 27.11 |
| 44633.802083333336 | 27.59 |
| 44633.8125 | 27.88 |
| 44633.822916666664 | 28.49 |
| 44633.833333333336 | 29.07 |
| 44633.84375 | 29.36 |
| 44633.854166666664 | 29.63 |
| 44633.864583333336 | 29.68 |
| 44633.875 | 29.85 |
| 44633.885416666664 | 29.89 |
| 44633.895833333336 | 29.99 |
| 44633.90625 | 30.08 |
| 44633.916666666664 | 30.16 |
| 44633.927083333336 | 30.2 |
| 44633.9375 | 30.36 |
| 44633.947916666664 | 30.35 |
| 44633.958333333336 | 30.32 |
| 44633.96875 | 30.27 |
| 44633.979166666664 | 30.18 |
| 44633.989583333336 | 30.24 |
| 44634.0 | 30.06 |
| 44634.010416666664 | 30.06 |
| 44634.020833333336 | 29.99 |
| 44634.03125 | 29.85 |
| 44634.041666666664 | 29.6 |
| 44634.052083333336 | 29.3 |
| 44634.0625 | 29.07 |
| 44634.072916666664 | 27 |
| 44634.083333333336 | 23.92 |
| 44634.09375 | 22.2 |
| 44634.104166666664 | 21.78 |
| 44634.114583333336 | 21.86 |
| 44634.125 | 21.99 |
| 44634.135416666664 | 21.96 |
| 44634.145833333336 | 21.68 |
| 44634.15625 | 21.47 |
| 44634.166666666664 | 21.53 |
| 44634.177083333336 | 22.15 |
| 44634.1875 | 22.15 |
| 44634.197916666664 | 22.88 |
| 44634.208333333336 | 23.13 |
| 44634.21875 | 23.35 |
| 44634.229166666664 | 24.08 |
| 44634.239583333336 | 25.58 |
| 44634.25 | 25.47 |
| 44634.260416666664 | 27.71 |
| 44634.270833333336 | 28.46 |
| 44634.28125 | 28.42 |
| 44634.291666666664 | 28.89 |
| 44634.302083333336 | 29.16 |
| 44634.3125 | 29.53 |
| 44634.322916666664 | 29.92 |
| 44634.333333333336 | 30.16 |
| 44634.34375 | 30.34 |
| 44634.354166666664 | 30.48 |
| 44634.364583333336 | 30.6 |
| 44634.375 | 30.68 |
| 44634.385416666664 | 30.78 |
| 44634.395833333336 | 30.84 |
| 44634.40625 | 30.87 |
| 44634.416666666664 | 30.91 |
| 44634.427083333336 | 30.94 |
| 44634.4375 | 30.99 |
| 44634.447916666664 | 30.97 |
| 44634.458333333336 | 30.96 |
| 44634.46875 | 30.91 |
| 44634.479166666664 | 30.95 |
| 44634.489583333336 | 30.92 |
| 44634.5 | 30.91 |
| 44634.510416666664 | 30.83 |
| 44634.520833333336 | 30.76 |
| 44634.53125 | 30.29 |
| 44634.541666666664 | 29.49 |
| 44634.552083333336 | 28.75 |
| 44634.5625 | 27.38 |
| 44634.572916666664 | 27.55 |
| 44634.583333333336 | 28.18 |
| 44634.59375 | 25.57 |
| 44634.604166666664 | 23.98 |
| 44634.614583333336 | 24.05 |
| 44634.625 | 23.53 |
| 44634.635416666664 | 23.97 |
| 44634.645833333336 | 23.87 |
| 44634.65625 | 22.46 |
| 44634.666666666664 | 22.67 |
| 44634.677083333336 | 22.61 |
| 44634.6875 | 22.05 |
| 44634.697916666664 | 22.11 |
| 44634.708333333336 | 22.56 |
| 44634.71875 | 21.8 |
| 44634.729166666664 | 21.74 |
| 44634.739583333336 | 22.9 |
| 44634.75 | 23.72 |
| 44634.760416666664 | 24.29 |
| 44634.770833333336 | 24.97 |
| 44634.78125 | 27.28 |
| 44634.791666666664 | 27.5 |
| 44634.802083333336 | 27.84 |
| 44634.8125 | 27.68 |
| 44634.822916666664 | 28.2 |
| 44634.833333333336 | 28.65 |
| 44634.84375 | 29.01 |
| 44634.854166666664 | 29.28 |
| 44634.864583333336 | 29.84 |
| 44634.875 | 30.08 |
| 44634.885416666664 | 30.35 |
| 44634.895833333336 | 30.5 |
| 44634.90625 | 30.62 |
| 44634.916666666664 | 30.76 |
| 44634.927083333336 | 30.85 |
| 44634.9375 | 30.94 |
| 44634.947916666664 | 30.96 |
| 44634.958333333336 | 31 |
| 44634.96875 | 31.05 |
| 44634.979166666664 | 31.07 |
| 44634.989583333336 | 31.04 |
| 44635.0 | 30.81 |
| 44635.010416666664 | 30.82 |
| 44635.020833333336 | 30.87 |
| 44635.03125 | 30.71 |
| 44635.041666666664 | 30.85 |
| 44635.052083333336 | 30.73 |
| 44635.0625 | 30.42 |
| 44635.072916666664 | 29.7 |
| 44635.083333333336 | 29.63 |
| 44635.09375 | 29.31 |
| 44635.104166666664 | 28.63 |
| 44635.114583333336 | 28 |
| 44635.125 | 27.31 |
| 44635.135416666664 | 26.97 |
| 44635.145833333336 | 26.57 |
| 44635.15625 | 25.93 |
| 44635.166666666664 | 25.67 |
| 44635.177083333336 | 25.56 |
| 44635.1875 | 25.25 |
| 44635.197916666664 | 25.6 |
| 44635.208333333336 | 25.41 |
| 44635.21875 | 25.75 |
| 44635.229166666664 | 26.58 |
| 44635.239583333336 | 27.39 |
| 44635.25 | 27.49 |
| 44635.260416666664 | 27.75 |
| 44635.270833333336 | 28.93 |
| 44635.28125 | 28.91 |
| 44635.291666666664 | 29.45 |
| 44635.302083333336 | 29.82 |
| 44635.3125 | 30.08 |
| 44635.322916666664 | 30.38 |
| 44635.333333333336 | 30.55 |
| 44635.34375 | 30.67 |
| 44635.354166666664 | 30.78 |
| 44635.364583333336 | 30.86 |
| 44635.375 | 30.92 |
| 44635.385416666664 | 30.96 |
| 44635.395833333336 | 30.99 |
| 44635.40625 | 31.01 |
| 44635.416666666664 | 31 |
| 44635.427083333336 | 31.01 |
| 44635.4375 | 31.02 |
| 44635.447916666664 | 31.04 |
| 44635.458333333336 | 31.04 |
| 44635.46875 | 31.04 |
| 44635.479166666664 | 31.05 |
| 44635.489583333336 | 31.04 |
| 44635.5 | 30.99 |
| 44635.510416666664 | 31.01 |
| 44635.520833333336 | 30.98 |
| 44635.53125 | 30.97 |
| 44635.541666666664 | 30.93 |
| 44635.552083333336 | 30.96 |
| 44635.5625 | 30.93 |
| 44635.572916666664 | 30.93 |
| 44635.583333333336 | 30.45 |
| 44635.59375 | 29.92 |
| 44635.604166666664 | 29.92 |
| 44635.614583333336 | 29.57 |
| 44635.625 | 29.14 |
| 44635.635416666664 | 28.71 |
| 44635.645833333336 | 28.42 |
| 44635.65625 | 28.17 |
| 44635.666666666664 | 27.92 |
| 44635.677083333336 | 27.65 |
| 44635.6875 | 27.43 |
| 44635.697916666664 | 27.22 |
| 44635.708333333336 | 27.17 |
| 44635.71875 | 27.21 |
| 44635.729166666664 | 27.32 |
| 44635.739583333336 | 27.47 |
| 44635.75 | 27.48 |
| 44635.760416666664 | 27.61 |
| 44635.770833333336 | 27.87 |
| 44635.78125 | 28.13 |
| 44635.791666666664 | 28.58 |
| 44635.802083333336 | 29.05 |
| 44635.8125 | 29.45 |
| 44635.822916666664 | 29.76 |
| 44635.833333333336 | 30.02 |
| 44635.84375 | 30.22 |
| 44635.854166666664 | 30.39 |
| 44635.864583333336 | 30.56 |
| 44635.875 | 30.7 |
| 44635.885416666664 | 30.81 |
| 44635.895833333336 | 30.85 |
| 44635.90625 | 30.89 |
| 44635.916666666664 | 30.93 |
| 44635.927083333336 | 30.97 |
| 44635.9375 | 31 |
| 44635.947916666664 | 31.02 |
| 44635.958333333336 | 31.04 |
| 44635.96875 | 31.05 |
| 44635.979166666664 | 31.06 |
| 44635.989583333336 | 31.07 |
| 44636.0 | 31.07 |
| 44636.010416666664 | 31.08 |
| 44636.020833333336 | 31.1 |
| 44636.03125 | 30.95 |
| 44636.041666666664 | 30.93 |
| 44636.052083333336 | 30.9 |
| 44636.0625 | 30.94 |
| 44636.072916666664 | 30.96 |
| 44636.083333333336 | 30.95 |
| 44636.09375 | 30.91 |
| 44636.104166666664 | 30.88 |
| 44636.114583333336 | 30.7 |
| 44636.125 | 30.39 |
| 44636.135416666664 | 30 |
| 44636.145833333336 | 29.36 |
| 44636.15625 | 28.97 |
| 44636.166666666664 | 28.71 |
| 44636.177083333336 | 28.5 |
| 44636.1875 | 28.33 |
| 44636.197916666664 | 28.22 |
| 44636.208333333336 | 28.02 |
| 44636.21875 | 27.89 |
| 44636.229166666664 | 27.69 |
| 44636.239583333336 | 27.62 |
| 44636.25 | 27.68 |
| 44636.260416666664 | 27.77 |
| 44636.270833333336 | 27.85 |
| 44636.28125 | 27.92 |
| 44636.291666666664 | 28.07 |
| 44636.302083333336 | 28.25 |
| 44636.3125 | 28.72 |
| 44636.322916666664 | 29.42 |
| 44636.333333333336 | 29.88 |
| 44636.34375 | 30.04 |
| 44636.354166666664 | 30.25 |
| 44636.364583333336 | 30.49 |
| 44636.375 | 30.65 |
| 44636.385416666664 | 30.76 |
| 44636.395833333336 | 30.84 |
| 44636.40625 | 30.89 |
| 44636.416666666664 | 30.92 |
| 44636.427083333336 | 30.95 |
| 44636.4375 | 30.99 |
| 44636.447916666664 | 31.03 |
| 44636.458333333336 | 31.07 |
| 44636.46875 | 31.11 |
| 44636.479166666664 | 31.13 |
| 44636.489583333336 | 31.14 |
| 44636.5 | 31.16 |
| 44636.510416666664 | 31.17 |
| 44636.520833333336 | 31.15 |
| 44636.53125 | 31.17 |
| 44636.541666666664 | 31.15 |
| 44636.552083333336 | 31.14 |
| 44636.5625 | 31.08 |
| 44636.572916666664 | 31.02 |
| 44636.583333333336 | 31.03 |
| 44636.59375 | 31.05 |
| 44636.604166666664 | 30.96 |
| 44636.614583333336 | 30.71 |
| 44636.625 | 30.66 |
| 44636.635416666664 | 30.27 |
| 44636.645833333336 | 30.08 |
| 44636.65625 | 29.9 |
| 44636.666666666664 | 29.63 |
| 44636.677083333336 | 29.03 |
| 44636.6875 | 28.62 |
| 44636.697916666664 | 28.28 |
| 44636.708333333336 | 27.99 |
| 44636.71875 | 27.68 |
| 44636.729166666664 | 27.57 |
| 44636.739583333336 | 27.48 |
| 44636.75 | 27.44 |
| 44636.760416666664 | 27.44 |
| 44636.770833333336 | 27.44 |
| 44636.78125 | 27.57 |
| 44636.791666666664 | 27.59 |
| 44636.802083333336 | 27.62 |
| 44636.8125 | 27.82 |
| 44636.822916666664 | 28.07 |
| 44636.833333333336 | 28.63 |
| 44636.84375 | 28.97 |
| 44636.854166666664 | 29.39 |
| 44636.864583333336 | 29.84 |
| 44636.875 | 30.14 |
| 44636.885416666664 | 30.25 |
| 44636.895833333336 | 30.25 |
| 44636.90625 | 30.36 |
| 44636.916666666664 | 30.51 |
| 44636.927083333336 | 30.66 |
| 44636.9375 | 30.77 |
| 44636.947916666664 | 30.84 |
| 44636.958333333336 | 30.91 |
| 44636.96875 | 30.98 |
| 44636.979166666664 | 31.05 |
| 44636.989583333336 | 31.1 |
| 44637.0 | 31.14 |
| 44637.010416666664 | 31.15 |
| 44637.020833333336 | 31.19 |
| 44637.03125 | 31.24 |
| 44637.041666666664 | 31.26 |
| 44637.052083333336 | 31.16 |
| 44637.0625 | 31.09 |
| 44637.072916666664 | 31.12 |
| 44637.083333333336 | 31.03 |
| 44637.09375 | 31.06 |
| 44637.104166666664 | 31.05 |
| 44637.114583333336 | 30.86 |
| 44637.125 | 30.77 |
| 44637.135416666664 | 30.69 |
| 44637.145833333336 | 30.39 |
| 44637.15625 | 30.17 |
| 44637.166666666664 | 29.99 |
| 44637.177083333336 | 29.63 |
| 44637.1875 | 29.34 |
| 44637.197916666664 | 29.1 |
| 44637.208333333336 | 28.94 |
| 44637.21875 | 28.68 |
| 44637.229166666664 | 28.46 |
| 44637.239583333336 | 28.25 |
| 44637.25 | 28.06 |
| 44637.260416666664 | 27.99 |
| 44637.270833333336 | 27.94 |
| 44637.28125 | 27.97 |
| 44637.291666666664 | 28.08 |
| 44637.302083333336 | 28.15 |
| 44637.3125 | 28.24 |
| 44637.322916666664 | 28.4 |
| 44637.333333333336 | 28.65 |
| 44637.34375 | 29.18 |
| 44637.354166666664 | 29.68 |
| 44637.364583333336 | 30.02 |
| 44637.375 | 30.09 |
| 44637.385416666664 | 30.25 |
| 44637.395833333336 | 30.34 |
| 44637.40625 | 30.52 |
| 44637.416666666664 | 30.63 |
| 44637.427083333336 | 30.74 |
| 44637.4375 | 30.86 |
| 44637.447916666664 | 30.92 |
| 44637.458333333336 | 31 |
| 44637.46875 | 31.06 |
| 44637.479166666664 | 31.11 |
| 44637.489583333336 | 31.15 |
| 44637.5 | 31.13 |
| 44637.510416666664 | 31.1 |
| 44637.520833333336 | 31.15 |
| 44637.53125 | 31.06 |
| 44637.541666666664 | 30.95 |
| 44637.552083333336 | 30.85 |
| 44637.5625 | 30.88 |
| 44637.572916666664 | 30.37 |
| 44637.583333333336 | 30.17 |
| 44637.59375 | 30.67 |
| 44637.604166666664 | 30.72 |
| 44637.614583333336 | 30.01 |
| 44637.625 | 30.11 |
| 44637.635416666664 | 29.92 |
| 44637.645833333336 | 29.53 |
| 44637.65625 | 29.22 |
| 44637.666666666664 | 28.61 |
| 44637.677083333336 | 29.1 |
| 44637.6875 | 29.12 |
| 44637.697916666664 | 28.67 |
| 44637.708333333336 | 28.52 |
| 44637.71875 | 28.77 |
| 44637.729166666664 | 28.67 |
| 44637.739583333336 | 28.84 |
| 44637.75 | 28.72 |
| 44637.760416666664 | 28.5 |
| 44637.770833333336 | 28.19 |
| 44637.78125 | 27.97 |
| 44637.791666666664 | 27.85 |
| 44637.802083333336 | 27.88 |
| 44637.8125 | 27.77 |
| 44637.822916666664 | 28.09 |
| 44637.833333333336 | 28.12 |
| 44637.84375 | 28.21 |
| 44637.854166666664 | 28.53 |
| 44637.864583333336 | 28.74 |
| 44637.875 | 29.09 |
| 44637.885416666664 | 29.6 |
| 44637.895833333336 | 29.96 |
| 44637.90625 | 29.97 |
| 44637.916666666664 | 29.94 |
| 44637.927083333336 | 30.08 |
| 44637.9375 | 30.18 |
| 44637.947916666664 | 30.3 |
| 44637.958333333336 | 30.39 |
| 44637.96875 | 30.44 |
| 44637.979166666664 | 30.47 |
| 44637.989583333336 | 30.53 |
| 44638.0 | 30.61 |
| 44638.010416666664 | 30.72 |
| 44638.020833333336 | 30.8 |
| 44638.03125 | 30.85 |
| 44638.041666666664 | 30.84 |
| 44638.052083333336 | 30.9 |
| 44638.0625 | 30.94 |
| 44638.072916666664 | 30.83 |
| 44638.083333333336 | 30.8 |
| 44638.09375 | 30.8 |
| 44638.104166666664 | 30.61 |
| 44638.114583333336 | 30.48 |
| 44638.125 | 30.32 |
| 44638.135416666664 | 30.23 |
| 44638.145833333336 | 30.13 |
| 44638.15625 | 29.77 |
| 44638.166666666664 | 29.92 |
| 44638.177083333336 | 29.85 |
| 44638.1875 | 29.65 |
| 44638.197916666664 | 29.51 |
| 44638.208333333336 | 28.97 |
| 44638.21875 | 28.4 |
| 44638.229166666664 | 27.82 |
| 44638.239583333336 | 27.3 |
| 44638.25 | 26.8 |
| 44638.260416666664 | 26.56 |
| 44638.270833333336 | 26.32 |
| 44638.28125 | 26.06 |
| 44638.291666666664 | 25.95 |
| 44638.302083333336 | 25.89 |
| 44638.3125 | 25.84 |
| 44638.322916666664 | 25.86 |
| 44638.333333333336 | 26.05 |
| 44638.34375 | 26.08 |
| 44638.354166666664 | 26.22 |
| 44638.364583333336 | 26.71 |
| 44638.375 | 27.54 |
| 44638.385416666664 | 28.34 |
| 44638.395833333336 | 29.15 |
| 44638.40625 | 29.25 |
| 44638.416666666664 | 29.3 |
| 44638.427083333336 | 29.49 |
| 44638.4375 | 29.66 |
| 44638.447916666664 | 29.82 |
| 44638.458333333336 | 29.97 |
| 44638.46875 | 30.19 |
| 44638.479166666664 | 30.34 |
| 44638.489583333336 | 30.52 |
| 44638.5 | 30.62 |
| 44638.510416666664 | 30.67 |
| 44638.520833333336 | 30.71 |
| 44638.53125 | 30.74 |
| 44638.541666666664 | 30.74 |
| 44638.552083333336 | 30.75 |
| 44638.5625 | 30.75 |
| 44638.572916666664 | 30.75 |
| 44638.583333333336 | 30.76 |
| 44638.59375 | 30.72 |
| 44638.604166666664 | 30.71 |
| 44638.614583333336 | 30.68 |
| 44638.625 | 30.69 |
| 44638.635416666664 | 30.5 |
| 44638.645833333336 | 30.26 |
| 44638.65625 | 30.02 |
| 44638.666666666664 | 29.76 |
| 44638.677083333336 | 29.63 |
| 44638.6875 | 29.47 |
| 44638.697916666664 | 29.51 |
| 44638.708333333336 | 29.47 |
| 44638.71875 | 29.25 |
| 44638.729166666664 | 28.87 |
| 44638.739583333336 | 28.4 |
| 44638.75 | 28.18 |
| 44638.760416666664 | 27.93 |
| 44638.770833333336 | 27.59 |
| 44638.78125 | 27.48 |
| 44638.791666666664 | 27.38 |
| 44638.802083333336 | 27.23 |
| 44638.8125 | 27.12 |
| 44638.822916666664 | 27.13 |
| 44638.833333333336 | 27.21 |
| 44638.84375 | 27.37 |
| 44638.854166666664 | 27.35 |
| 44638.864583333336 | 27.4 |
| 44638.875 | 27.6 |
| 44638.885416666664 | 28.08 |
| 44638.895833333336 | 28.53 |
| 44638.90625 | 28.84 |
| 44638.916666666664 | 29.1 |
| 44638.927083333336 | 29.32 |
| 44638.9375 | 29.56 |
| 44638.947916666664 | 29.75 |
| 44638.958333333336 | 29.96 |
| 44638.96875 | 30.15 |
| 44638.979166666664 | 30.27 |
| 44638.989583333336 | 30.39 |
| 44639.0 | 30.55 |
| 44639.010416666664 | 30.65 |
| 44639.020833333336 | 30.72 |
| 44639.03125 | 30.76 |
| 44639.041666666664 | 30.78 |
| 44639.052083333336 | 30.79 |
| 44639.0625 | 30.81 |
| 44639.072916666664 | 30.79 |
| 44639.083333333336 | 30.8 |
| 44639.09375 | 30.82 |
| 44639.104166666664 | 30.82 |
| 44639.114583333336 | 30.84 |
| 44639.125 | 30.76 |
| 44639.135416666664 | 30.67 |
| 44639.145833333336 | 30.67 |
| 44639.15625 | 30.56 |
| 44639.166666666664 | 30.45 |
| 44639.177083333336 | 30.43 |
| 44639.1875 | 30.4 |
| 44639.197916666664 | 30.19 |
| 44639.208333333336 | 29.89 |
| 44639.21875 | 29.94 |
| 44639.229166666664 | 29.69 |
| 44639.239583333336 | 29.38 |
| 44639.25 | 29.1 |
| 44639.260416666664 | 28.67 |
| 44639.270833333336 | 28.28 |
| 44639.28125 | 27.8 |
| 44639.291666666664 | 27.4 |
| 44639.302083333336 | 27.17 |
| 44639.3125 | 26.78 |
| 44639.322916666664 | 26.53 |
| 44639.333333333336 | 26.41 |
| 44639.34375 | 26.46 |
| 44639.354166666664 | 26.66 |
| 44639.364583333336 | 26.73 |
| 44639.375 | 26.92 |
| 44639.385416666664 | 27.21 |
| 44639.395833333336 | 27.83 |
| 44639.40625 | 28.44 |
| 44639.416666666664 | 28.87 |
| 44639.427083333336 | 29.1 |
| 44639.4375 | 29.4 |
| 44639.447916666664 | 29.64 |
| 44639.458333333336 | 29.86 |
| 44639.46875 | 30.04 |
| 44639.479166666664 | 30.19 |
| 44639.489583333336 | 30.35 |
| 44639.5 | 30.48 |
| 44639.510416666664 | 30.59 |
| 44639.520833333336 | 30.67 |
| 44639.53125 | 30.72 |
| 44639.541666666664 | 30.77 |
| 44639.552083333336 | 30.79 |
| 44639.5625 | 30.8 |
| 44639.572916666664 | 30.8 |
| 44639.583333333336 | 30.81 |
| 44639.59375 | 30.81 |
| 44639.604166666664 | 30.81 |
| 44639.614583333336 | 30.69 |
| 44639.625 | 30.69 |
| 44639.635416666664 | 30.73 |
| 44639.645833333336 | 30.61 |
| 44639.65625 | 30.67 |
| 44639.666666666664 | 30.57 |
| 44639.677083333336 | 30.42 |
| 44639.6875 | 30.14 |
| 44639.697916666664 | 29.93 |
| 44639.708333333336 | 29.64 |
| 44639.71875 | 29.59 |
| 44639.729166666664 | 29.73 |
| 44639.739583333336 | 29.68 |
| 44639.75 | 29.18 |
| 44639.760416666664 | 28.67 |
| 44639.770833333336 | 28.32 |
| 44639.78125 | 28.05 |
| 44639.791666666664 | 27.92 |
| 44639.802083333336 | 27.7 |
| 44639.8125 | 27.52 |
| 44639.822916666664 | 27.21 |
| 44639.833333333336 | 27.02 |
| 44639.84375 | 26.97 |
| 44639.854166666664 | 27.18 |
| 44639.864583333336 | 27.34 |
| 44639.875 | 27.37 |
| 44639.885416666664 | 27.49 |
| 44639.895833333336 | 27.76 |
| 44639.90625 | 28.26 |
| 44639.916666666664 | 28.65 |
| 44639.927083333336 | 29.18 |
| 44639.9375 | 29.53 |
| 44639.947916666664 | 29.91 |
| 44639.958333333336 | 30.25 |
| 44639.96875 | 30.4 |
| 44639.979166666664 | 30.47 |
| 44639.989583333336 | 30.52 |
| 44640.0 | 30.56 |
| 44640.010416666664 | 30.64 |
| 44640.020833333336 | 30.74 |
| 44640.03125 | 30.8 |
| 44640.041666666664 | 30.85 |
| 44640.052083333336 | 30.86 |
| 44640.0625 | 30.87 |
| 44640.072916666664 | 30.88 |
| 44640.083333333336 | 30.9 |
| 44640.09375 | 30.91 |
| 44640.104166666664 | 30.93 |
| 44640.114583333336 | 30.95 |
| 44640.125 | 30.96 |
| 44640.135416666664 | 30.86 |
| 44640.145833333336 | 30.89 |
| 44640.15625 | 30.87 |
| 44640.166666666664 | 30.82 |
| 44640.177083333336 | 30.75 |
| 44640.1875 | 30.78 |
| 44640.197916666664 | 30.7 |
| 44640.208333333336 | 30.7 |
| 44640.21875 | 30.59 |
| 44640.229166666664 | 30.48 |
| 44640.239583333336 | 30.28 |
| 44640.25 | 30.05 |
| 44640.260416666664 | 29.71 |
| 44640.270833333336 | 29.43 |
| 44640.28125 | 28.96 |
| 44640.291666666664 | 28.6 |
| 44640.302083333336 | 28.35 |
| 44640.3125 | 28.08 |
| 44640.322916666664 | 27.81 |
| 44640.333333333336 | 27.4 |
| 44640.34375 | 26.99 |
| 44640.354166666664 | 26.79 |
| 44640.364583333336 | 26.82 |
| 44640.375 | 26.7 |
| 44640.385416666664 | 26.81 |
| 44640.395833333336 | 26.94 |
| 44640.40625 | 27.12 |
| 44640.416666666664 | 27.39 |
| 44640.427083333336 | 27.87 |
| 44640.4375 | 28.83 |
| 44640.447916666664 | 29.4 |
| 44640.458333333336 | 29.69 |
| 44640.46875 | 29.66 |
| 44640.479166666664 | 29.71 |
| 44640.489583333336 | 29.78 |
| 44640.5 | 29.93 |
| 44640.510416666664 | 30.18 |
| 44640.520833333336 | 30.37 |
| 44640.53125 | 30.53 |
| 44640.541666666664 | 30.63 |
| 44640.552083333336 | 30.74 |
| 44640.5625 | 30.82 |
| 44640.572916666664 | 30.93 |
| 44640.583333333336 | 30.99 |
| 44640.59375 | 31.05 |
| 44640.604166666664 | 31.08 |
| 44640.614583333336 | 31.09 |
| 44640.625 | 31.1 |
| 44640.635416666664 | 31.1 |
| 44640.645833333336 | 31.07 |
| 44640.65625 | 31.09 |
| 44640.666666666664 | 31.08 |
| 44640.677083333336 | 31.07 |
| 44640.6875 | 30.99 |
| 44640.697916666664 | 30.96 |
| 44640.708333333336 | 30.75 |
| 44640.71875 | 30.63 |
| 44640.729166666664 | 30.55 |
| 44640.739583333336 | 30.47 |
| 44640.75 | 30.34 |
| 44640.760416666664 | 30.16 |
| 44640.770833333336 | 30.09 |
| 44640.78125 | 29.84 |
| 44640.791666666664 | 29.23 |
| 44640.802083333336 | 28.73 |
| 44640.8125 | 28.29 |
| 44640.822916666664 | 27.75 |
| 44640.833333333336 | 27.51 |
| 44640.84375 | 27.1 |
| 44640.854166666664 | 26.88 |
| 44640.864583333336 | 26.87 |
| 44640.875 | 26.75 |
| 44640.885416666664 | 26.79 |
| 44640.895833333336 | 26.97 |
| 44640.90625 | 27.09 |
| 44640.916666666664 | 27.23 |
| 44640.927083333336 | 27.51 |
| 44640.9375 | 28.49 |
| 44640.947916666664 | 29.63 |
| 44640.958333333336 | 29.94 |
| 44640.96875 | 30.02 |
| 44640.979166666664 | 30.03 |
| 44640.989583333336 | 30.08 |
| 44641.0 | 30.22 |
| 44641.010416666664 | 30.33 |
| 44641.020833333336 | 30.41 |
| 44641.03125 | 30.6 |
| 44641.041666666664 | 30.77 |
| 44641.052083333336 | 30.84 |
| 44641.0625 | 30.95 |
| 44641.072916666664 | 31.09 |
| 44641.083333333336 | 31.19 |
| 44641.09375 | 31.26 |
| 44641.104166666664 | 31.3 |
| 44641.114583333336 | 31.32 |
| 44641.125 | 31.34 |
| 44641.135416666664 | 31.35 |
| 44641.145833333336 | 31.36 |
| 44641.15625 | 31.37 |
| 44641.166666666664 | 31.32 |
| 44641.177083333336 | 31.3 |
| 44641.1875 | 31.31 |
| 44641.197916666664 | 31.27 |
| 44641.208333333336 | 31.2 |
| 44641.21875 | 31.14 |
| 44641.229166666664 | 31.04 |
| 44641.239583333336 | 31.02 |
| 44641.25 | 30.87 |
| 44641.260416666664 | 30.65 |
| 44641.270833333336 | 30.55 |
| 44641.28125 | 30.52 |
| 44641.291666666664 | 30.18 |
| 44641.302083333336 | 29.86 |
| 44641.3125 | 29.56 |
| 44641.322916666664 | 29.25 |
| 44641.333333333336 | 28.98 |
| 44641.34375 | 28.67 |
| 44641.354166666664 | 28.42 |
| 44641.364583333336 | 28.19 |
| 44641.375 | 28.03 |
| 44641.385416666664 | 27.97 |
| 44641.395833333336 | 27.96 |
| 44641.40625 | 27.93 |
| 44641.416666666664 | 28.08 |
| 44641.427083333336 | 28 |
| 44641.4375 | 28.03 |
| 44641.447916666664 | 28.2 |
| 44641.458333333336 | 28.54 |
| 44641.46875 | 29.3 |
| 44641.479166666664 | 29.79 |
| 44641.489583333336 | 30.07 |
| 44641.5 | 30.22 |
| 44641.510416666664 | 30.3 |
| 44641.520833333336 | 30.39 |
| 44641.53125 | 30.5 |
| 44641.541666666664 | 30.62 |
| 44641.552083333336 | 30.73 |
| 44641.5625 | 30.85 |
| 44641.572916666664 | 31.02 |
| 44641.583333333336 | 31.13 |
| 44641.59375 | 31.26 |
| 44641.604166666664 | 31.36 |
| 44641.614583333336 | 31.44 |
| 44641.625 | 31.47 |
| 44641.635416666664 | 31.5 |
| 44641.645833333336 | 31.51 |
| 44641.65625 | 31.51 |
| 44641.666666666664 | 31.48 |
| 44641.677083333336 | 31.48 |
| 44641.6875 | 31.46 |
| 44641.697916666664 | 31.45 |
| 44641.708333333336 | 31.41 |
| 44641.71875 | 31.35 |
| 44641.729166666664 | 31.24 |
| 44641.739583333336 | 31.1 |
| 44641.75 | 31.16 |
| 44641.760416666664 | 30.97 |
| 44641.770833333336 | 30.92 |
| 44641.78125 | 30.73 |
| 44641.791666666664 | 30.44 |
| 44641.802083333336 | 30.11 |
| 44641.8125 | 29.86 |
| 44641.822916666664 | 29.64 |
| 44641.833333333336 | 29.47 |
| 44641.84375 | 29.24 |
| 44641.854166666664 | 28.94 |
| 44641.864583333336 | 28.65 |
| 44641.875 | 28.41 |
| 44641.885416666664 | 28.32 |
| 44641.895833333336 | 28.14 |
| 44641.90625 | 28.11 |
| 44641.916666666664 | 28.22 |
| 44641.927083333336 | 28.32 |
| 44641.9375 | 28.37 |
| 44641.947916666664 | 28.57 |
| 44641.958333333336 | 28.88 |
| 44641.96875 | 29.39 |
| 44641.979166666664 | 29.93 |
| 44641.989583333336 | 30.17 |
| 44642.0 | 30.42 |
| 44642.010416666664 | 30.57 |
| 44642.020833333336 | 30.74 |
| 44642.03125 | 30.86 |
| 44642.041666666664 | 31 |
| 44642.052083333336 | 31.11 |
| 44642.0625 | 31.22 |
| 44642.072916666664 | 31.34 |
| 44642.083333333336 | 31.42 |
| 44642.09375 | 31.47 |
| 44642.104166666664 | 31.52 |
| 44642.114583333336 | 31.54 |
| 44642.125 | 31.55 |
| 44642.135416666664 | 31.55 |
| 44642.145833333336 | 31.55 |
| 44642.15625 | 31.56 |
| 44642.166666666664 | 31.57 |
| 44642.177083333336 | 31.57 |
| 44642.1875 | 31.53 |
| 44642.197916666664 | 31.49 |
| 44642.208333333336 | 31.49 |
| 44642.21875 | 31.48 |
| 44642.229166666664 | 31.44 |
| 44642.239583333336 | 31.44 |
| 44642.25 | 31.35 |
| 44642.260416666664 | 31.31 |
| 44642.270833333336 | 31.21 |
| 44642.28125 | 31.17 |
| 44642.291666666664 | 31.05 |
| 44642.302083333336 | 31.02 |
| 44642.3125 | 30.96 |
| 44642.322916666664 | 30.67 |
| 44642.333333333336 | 30.35 |
| 44642.34375 | 30.03 |
| 44642.354166666664 | 29.84 |
| 44642.364583333336 | 29.65 |
| 44642.375 | 29.37 |
| 44642.385416666664 | 29.16 |
| 44642.395833333336 | 29.03 |
| 44642.40625 | 28.77 |
| 44642.416666666664 | 28.66 |
| 44642.427083333336 | 28.66 |
| 44642.4375 | 28.66 |
| 44642.447916666664 | 28.69 |
| 44642.458333333336 | 28.82 |
| 44642.46875 | 28.7 |
| 44642.479166666664 | 28.77 |
| 44642.489583333336 | 28.83 |
| 44642.5 | 29.29 |
| 44642.510416666664 | 29.68 |
| 44642.520833333336 | 29.94 |
| 44642.53125 | 30.2 |
| 44642.541666666664 | 30.49 |
| 44642.552083333336 | 30.62 |
| 44642.5625 | 30.71 |
| 44642.572916666664 | 30.83 |
| 44642.583333333336 | 30.96 |
| 44642.59375 | 31.11 |
| 44642.604166666664 | 31.2 |
| 44642.614583333336 | 31.3 |
| 44642.625 | 31.43 |
| 44642.635416666664 | 31.49 |
| 44642.645833333336 | 31.54 |
| 44642.65625 | 31.57 |
| 44642.666666666664 | 31.6 |
| 44642.677083333336 | 31.61 |
| 44642.6875 | 31.61 |
| 44642.697916666664 | 31.55 |
| 44642.708333333336 | 31.34 |
| 44642.71875 | 31.52 |
| 44642.729166666664 | 31.58 |
| 44642.739583333336 | 31.56 |
| 44642.75 | 31.47 |
| 44642.760416666664 | 31.41 |
| 44642.770833333336 | 31.29 |
| 44642.78125 | 31.25 |
| 44642.791666666664 | 31.14 |
| 44642.802083333336 | 30.9 |
| 44642.8125 | 30.68 |
| 44642.822916666664 | 30.48 |
| 44642.833333333336 | 30.28 |
| 44642.84375 | 30.12 |
| 44642.854166666664 | 29.98 |
| 44642.864583333336 | 29.89 |
| 44642.875 | 29.81 |
| 44642.885416666664 | 29.47 |
| 44642.895833333336 | 29.18 |
| 44642.90625 | 29.12 |
| 44642.916666666664 | 29.08 |
| 44642.927083333336 | 29.05 |
| 44642.9375 | 29.07 |
| 44642.947916666664 | 29.1 |
| 44642.958333333336 | 29.17 |
| 44642.96875 | 29.17 |
| 44642.979166666664 | 29.22 |
| 44642.989583333336 | 29.4 |
| 44643.0 | 29.61 |
| 44643.010416666664 | 29.87 |
| 44643.020833333336 | 30.26 |
| 44643.03125 | 30.58 |
| 44643.041666666664 | 30.79 |
| 44643.052083333336 | 30.92 |
| 44643.0625 | 31.02 |
| 44643.072916666664 | 31.13 |
| 44643.083333333336 | 31.28 |
| 44643.09375 | 31.38 |
| 44643.104166666664 | 31.46 |
| 44643.114583333336 | 31.54 |
| 44643.125 | 31.6 |
| 44643.135416666664 | 31.65 |
| 44643.145833333336 | 31.7 |
| 44643.15625 | 31.74 |
| 44643.166666666664 | 31.76 |
| 44643.177083333336 | 31.78 |
| 44643.1875 | 31.79 |
| 44643.197916666664 | 31.79 |
| 44643.208333333336 | 31.79 |
| 44643.21875 | 31.69 |
| 44643.229166666664 | 31.57 |
| 44643.239583333336 | 31.68 |
| 44643.25 | 31.68 |
| 44643.260416666664 | 31.66 |
| 44643.270833333336 | 31.64 |
| 44643.28125 | 31.61 |
| 44643.291666666664 | 31.53 |
| 44643.302083333336 | 31.61 |
| 44643.3125 | 31.45 |
| 44643.322916666664 | 31.29 |
| 44643.333333333336 | 31.2 |
| 44643.34375 | 31.17 |
| 44643.354166666664 | 31.05 |
| 44643.364583333336 | 30.94 |
| 44643.375 | 30.74 |
| 44643.385416666664 | 30.46 |
| 44643.395833333336 | 30.19 |
| 44643.40625 | 30.01 |
| 44643.416666666664 | 29.84 |
| 44643.427083333336 | 29.7 |
| 44643.4375 | 29.56 |
| 44643.447916666664 | 29.44 |
| 44643.458333333336 | 29.37 |
| 44643.46875 | 29.31 |
| 44643.479166666664 | 29.31 |
| 44643.489583333336 | 29.22 |
| 44643.5 | 29.41 |
| 44643.510416666664 | 29.36 |
| 44643.520833333336 | 29.45 |
| 44643.53125 | 29.56 |
| 44643.541666666664 | 29.78 |
| 44643.552083333336 | 30.24 |
| 44643.5625 | 30.66 |
| 44643.572916666664 | 30.75 |
| 44643.583333333336 | 30.81 |
| 44643.59375 | 30.92 |
| 44643.604166666664 | 30.96 |
| 44643.614583333336 | 31.03 |
| 44643.625 | 31.2 |
| 44643.635416666664 | 31.3 |
| 44643.645833333336 | 31.39 |
| 44643.65625 | 31.46 |
| 44643.666666666664 | 31.51 |
| 44643.677083333336 | 31.55 |
| 44643.6875 | 31.6 |
| 44643.697916666664 | 31.62 |
| 44643.708333333336 | 31.61 |
| 44643.71875 | 31.69 |
| 44643.729166666664 | 31.74 |
| 44643.739583333336 | 31.8 |
| 44643.75 | 31.62 |
| 44643.760416666664 | 31.62 |
| 44643.770833333336 | 31.64 |
| 44643.78125 | 31.62 |
| 44643.791666666664 | 31.58 |
| 44643.802083333336 | 31.56 |
| 44643.8125 | 31.44 |
| 44643.822916666664 | 31.31 |
| 44643.833333333336 | 31.23 |
| 44643.84375 | 31.06 |
| 44643.854166666664 | 30.88 |
| 44643.864583333336 | 30.76 |
| 44643.875 | 30.49 |
| 44643.885416666664 | 30.34 |
| 44643.895833333336 | 30.18 |
| 44643.90625 | 30.01 |
| 44643.916666666664 | 30.03 |
| 44643.927083333336 | 29.96 |
| 44643.9375 | 29.92 |
| 44643.947916666664 | 29.91 |
| 44643.958333333336 | 29.91 |
| 44643.96875 | 29.97 |
| 44643.979166666664 | 29.96 |
| 44643.989583333336 | 30.03 |
| 44644.0 | 30.06 |
| 44644.010416666664 | 30.12 |
| 44644.020833333336 | 30.36 |
| 44644.03125 | 30.49 |
| 44644.041666666664 | 30.82 |
| 44644.052083333336 | 30.98 |
| 44644.0625 | 31.1 |
| 44644.072916666664 | 31.21 |
| 44644.083333333336 | 31.28 |
| 44644.09375 | 31.34 |
| 44644.104166666664 | 31.42 |
| 44644.114583333336 | 31.43 |
| 44644.125 | 31.48 |
| 44644.135416666664 | 31.52 |
| 44644.145833333336 | 31.54 |
| 44644.15625 | 31.57 |
| 44644.166666666664 | 31.59 |
| 44644.177083333336 | 31.64 |
| 44644.1875 | 31.68 |
| 44644.197916666664 | 31.7 |
| 44644.208333333336 | 31.72 |
| 44644.21875 | 31.72 |
| 44644.229166666664 | 31.74 |
| 44644.239583333336 | 31.76 |
| 44644.25 | 31.77 |
| 44644.260416666664 | 31.78 |
| 44644.270833333336 | 31.66 |
| 44644.28125 | 31.61 |
| 44644.291666666664 | 31.67 |
| 44644.302083333336 | 31.7 |
| 44644.3125 | 31.65 |
| 44644.322916666664 | 31.6 |
| 44644.333333333336 | 31.5 |
| 44644.34375 | 31.52 |
| 44644.354166666664 | 31.46 |
| 44644.364583333336 | 31.41 |
| 44644.375 | 31.46 |
| 44644.385416666664 | 31.35 |
| 44644.395833333336 | 31.33 |
| 44644.40625 | 31.16 |
| 44644.416666666664 | 31.1 |
| 44644.427083333336 | 31 |
| 44644.4375 | 30.97 |
| 44644.447916666664 | 30.87 |
| 44644.458333333336 | 30.7 |
| 44644.46875 | 30.47 |
| 44644.479166666664 | 30.13 |
| 44644.489583333336 | 29.77 |
| 44644.5 | 29.4 |
| 44644.510416666664 | 28.71 |
| 44644.520833333336 | 28.81 |
| 44644.53125 | 27.4 |
| 44644.541666666664 | 25.21 |
| 44644.552083333336 | 27.89 |
| 44644.5625 | 24.49 |
| 44644.572916666664 | 27.13 |
| 44644.583333333336 | 26.81 |
| 44644.59375 | 27.06 |
| 44644.604166666664 | 27.26 |
| 44644.614583333336 | 26.92 |
| 44644.625 | 27.87 |
| 44644.635416666664 | 27.28 |
| 44644.645833333336 | 27.09 |
| 44644.65625 | 27.87 |
| 44644.666666666664 | 27.84 |
| 44644.677083333336 | 27.34 |
| 44644.6875 | 27.37 |
| 44644.697916666664 | 27.16 |
| 44644.708333333336 | 27.52 |
| 44644.71875 | 27.51 |
| 44644.729166666664 | 26.5 |
| 44644.739583333336 | 27.23 |
| 44644.75 | 27.07 |
| 44644.760416666664 | 25.27 |
| 44644.770833333336 | 24.24 |
| 44644.78125 | 23.27 |
| 44644.791666666664 | 23.41 |
| 44644.802083333336 | 24.67 |
| 44644.8125 | 23.98 |
| 44644.822916666664 | 24.86 |
| 44644.833333333336 | 21 |
| 44644.84375 | 18.24 |
| 44644.854166666664 | 21.91 |
| 44644.864583333336 | 19.17 |
| 44644.875 | 16.17 |
| 44644.885416666664 | 14.36 |
| 44644.895833333336 | 13.51 |
| 44644.90625 | 12.88 |
| 44644.916666666664 | 12.59 |
| 44644.927083333336 | 11.79 |
| 44644.9375 | 11 |
| 44644.947916666664 | 10.37 |
| 44644.958333333336 | 9.24 |
| 44644.96875 | 8.45 |
| 44644.979166666664 | 8.66 |
| 44644.989583333336 | 8.41 |
| 44645.0 | 8.65 |
| 44645.010416666664 | 8.64 |
| 44645.020833333336 | 8.87 |
| 44645.03125 | 9.1 |
| 44645.041666666664 | 9.29 |
| 44645.052083333336 | 10.58 |
| 44645.0625 | 12.28 |
| 44645.072916666664 | 13.71 |
| 44645.083333333336 | 15.86 |
| 44645.09375 | 19.72 |
| 44645.104166666664 | 21.44 |
| 44645.114583333336 | 21.88 |
| 44645.125 | 22.38 |
| 44645.135416666664 | 22.85 |
| 44645.145833333336 | 23.79 |
| 44645.15625 | 24.36 |
| 44645.166666666664 | 25.16 |
| 44645.177083333336 | 25.1 |
| 44645.1875 | 25.18 |
| 44645.197916666664 | 25.45 |
| 44645.208333333336 | 25.55 |
| 44645.21875 | 25.55 |
| 44645.229166666664 | 25.75 |
| 44645.239583333336 | 26.08 |
| 44645.25 | 26.55 |
| 44645.260416666664 | 27.1 |
| 44645.270833333336 | 27.43 |
| 44645.28125 | 27.53 |
| 44645.291666666664 | 27.75 |
| 44645.302083333336 | 27.45 |
| 44645.3125 | 27.37 |
| 44645.322916666664 | 26.74 |
| 44645.333333333336 | 26.97 |
| 44645.34375 | 26.75 |
| 44645.354166666664 | 25.36 |
| 44645.364583333336 | 24.91 |
| 44645.375 | 24.53 |
| 44645.385416666664 | 23.34 |
| 44645.395833333336 | 22.49 |
| 44645.40625 | 21.4 |
| 44645.416666666664 | 19.58 |
| 44645.427083333336 | 18.94 |
| 44645.4375 | 17.02 |
| 44645.447916666664 | 16.43 |
| 44645.458333333336 | 15.76 |
| 44645.46875 | 14.37 |
| 44645.479166666664 | 13.96 |
| 44645.489583333336 | 13.81 |
| 44645.5 | 14.28 |
| 44645.510416666664 | 13.98 |
| 44645.520833333336 | 14.11 |
| 44645.53125 | 13.69 |
| 44645.541666666664 | 13.25 |
| 44645.552083333336 | 13.07 |
| 44645.5625 | 12.9 |
| 44645.572916666664 | 13.17 |
| 44645.583333333336 | 13.61 |
| 44645.59375 | 14.15 |
| 44645.604166666664 | 14.91 |
| 44645.614583333336 | 14.59 |
| 44645.625 | 15.56 |
| 44645.635416666664 | 16.18 |
| 44645.645833333336 | 16.54 |
| 44645.65625 | 17.5 |
| 44645.666666666664 | 18.35 |
| 44645.677083333336 | 18.3 |
| 44645.6875 | 22.87 |
| 44645.697916666664 | 22.96 |
| 44645.708333333336 | 25.11 |
| 44645.71875 | 26.11 |
| 44645.729166666664 | 25.99 |
| 44645.739583333336 | 26.47 |
| 44645.75 | 26.71 |
| 44645.760416666664 | 27.17 |
| 44645.770833333336 | 27.16 |
| 44645.78125 | 27.55 |
| 44645.791666666664 | 27.08 |
| 44645.802083333336 | 26.99 |
| 44645.8125 | 26.93 |
| 44645.822916666664 | 26.85 |
| 44645.833333333336 | 26.78 |
| 44645.84375 | 26.79 |
| 44645.854166666664 | 26.75 |
| 44645.864583333336 | 25.93 |
| 44645.875 | 25.35 |
| 44645.885416666664 | 24.18 |
| 44645.895833333336 | 23.3 |
| 44645.90625 | 24.76 |
| 44645.916666666664 | 26.05 |
| 44645.927083333336 | 22.65 |
| 44645.9375 | 20.76 |
| 44645.947916666664 | 20.18 |
| 44645.958333333336 | 19.64 |
| 44645.96875 | 19.19 |
| 44645.979166666664 | 18.86 |
| 44645.989583333336 | 18.59 |
| 44646.0 | 18.34 |
| 44646.010416666664 | 18.08 |
| 44646.020833333336 | 17.57 |
| 44646.03125 | 16.95 |
| 44646.041666666664 | 16.3 |
| 44646.052083333336 | 15.85 |
| 44646.0625 | 15.53 |
| 44646.072916666664 | 15.47 |
| 44646.083333333336 | 15.56 |
| 44646.09375 | 15.75 |
| 44646.104166666664 | 16.63 |
| 44646.114583333336 | 18.5 |
| 44646.125 | 19.07 |
| 44646.135416666664 | 20.54 |
| 44646.145833333336 | 22.14 |
| 44646.15625 | 22.76 |
| 44646.166666666664 | 23 |
| 44646.177083333336 | 23.63 |
| 44646.1875 | 25.12 |
| 44646.197916666664 | 25.95 |
| 44646.208333333336 | 26.86 |
| 44646.21875 | 26.97 |
| 44646.229166666664 | 27.04 |
| 44646.239583333336 | 27.15 |
| 44646.25 | 27.37 |
| 44646.260416666664 | 27.5 |
| 44646.270833333336 | 27.62 |
| 44646.28125 | 27.7 |
| 44646.291666666664 | 27.74 |
| 44646.302083333336 | 27.79 |
| 44646.3125 | 27.83 |
| 44646.322916666664 | 27.88 |
| 44646.333333333336 | 27.91 |
| 44646.34375 | 27.92 |
| 44646.354166666664 | 28.05 |
| 44646.364583333336 | 28 |
| 44646.375 | 27.94 |
| 44646.385416666664 | 27.92 |
| 44646.395833333336 | 27.86 |
| 44646.40625 | 27.76 |
| 44646.416666666664 | 27.27 |
| 44646.427083333336 | 26.66 |
| 44646.4375 | 25.58 |
| 44646.447916666664 | 24.22 |
| 44646.458333333336 | 23.28 |
| 44646.46875 | 22.01 |
| 44646.479166666664 | 21 |
| 44646.489583333336 | 20.49 |
| 44646.5 | 20.31 |
| 44646.510416666664 | 20.29 |
| 44646.520833333336 | 19.89 |
| 44646.53125 | 20.28 |
| 44646.541666666664 | 20.3 |
| 44646.552083333336 | 20.17 |
| 44646.5625 | 19.86 |
| 44646.572916666664 | 19.69 |
| 44646.583333333336 | 19.29 |
| 44646.59375 | 19.3 |
| 44646.604166666664 | 19.11 |
| 44646.614583333336 | 19.33 |
| 44646.625 | 19.55 |
| 44646.635416666664 | 19.77 |
| 44646.645833333336 | 20.17 |
| 44646.65625 | 20.4 |
| 44646.666666666664 | 20.58 |
| 44646.677083333336 | 21.25 |
| 44646.6875 | 22.94 |
| 44646.697916666664 | 23.73 |
| 44646.708333333336 | 24.52 |
| 44646.71875 | 24.49 |
| 44646.729166666664 | 24.43 |
| 44646.739583333336 | 24.56 |
| 44646.75 | 25.21 |
| 44646.760416666664 | 25.72 |
| 44646.770833333336 | 26 |
| 44646.78125 | 26.25 |
| 44646.791666666664 | 26.65 |
| 44646.802083333336 | 27.46 |
| 44646.8125 | 27.92 |
| 44646.822916666664 | 28.11 |
| 44646.833333333336 | 28.24 |
| 44646.84375 | 28.28 |
| 44646.854166666664 | 28.33 |
| 44646.864583333336 | 28.26 |
| 44646.875 | 28.2 |
| 44646.885416666664 | 28.13 |
| 44646.895833333336 | 27.59 |
| 44646.90625 | 26.68 |
| 44646.916666666664 | 27.06 |
| 44646.927083333336 | 26.49 |
| 44646.9375 | 25.68 |
| 44646.947916666664 | 25.37 |
| 44646.958333333336 | 24.93 |
| 44646.96875 | 24.5 |
| 44646.979166666664 | 24.3 |
| 44646.989583333336 | 23.93 |
| 44647.0 | 22.95 |
| 44647.010416666664 | 22.2 |
| 44647.020833333336 | 21.69 |
| 44647.03125 | 21.42 |
| 44647.041666666664 | 21.08 |
| 44647.052083333336 | 20.36 |
| 44647.0625 | 19.9 |
| 44647.072916666664 | 19.29 |
| 44647.083333333336 | 19.01 |
| 44647.09375 | 18.69 |
| 44647.104166666664 | 18.36 |
| 44647.114583333336 | 17.92 |
| 44647.125 | 18.18 |
| 44647.135416666664 | 18.25 |
| 44647.145833333336 | 18.9 |
| 44647.15625 | 20.23 |
| 44647.166666666664 | 20.73 |
| 44647.177083333336 | 23.99 |
| 44647.1875 | 24.08 |
| 44647.197916666664 | 24.6 |
| 44647.208333333336 | 24.71 |
| 44647.21875 | 24.92 |
| 44647.229166666664 | 25.41 |
| 44647.239583333336 | 26.2 |
| 44647.25 | 26.32 |
| 44647.260416666664 | 26.37 |
| 44647.270833333336 | 26.62 |
| 44647.28125 | 26.87 |
| 44647.291666666664 | 27.15 |
| 44647.302083333336 | 27.46 |
| 44647.3125 | 27.78 |
| 44647.322916666664 | 28.04 |
| 44647.333333333336 | 28.29 |
| 44647.34375 | 28.51 |
| 44647.354166666664 | 28.65 |
| 44647.364583333336 | 28.74 |
| 44647.375 | 28.78 |
| 44647.385416666664 | 28.82 |
| 44647.395833333336 | 28.8 |
| 44647.40625 | 28.87 |
| 44647.416666666664 | 28.95 |
| 44647.427083333336 | 28.92 |
| 44647.4375 | 28.74 |
| 44647.447916666664 | 28.76 |
| 44647.458333333336 | 28.42 |
| 44647.46875 | 28.38 |
| 44647.479166666664 | 27.82 |
| 44647.489583333336 | 28.02 |
| 44647.5 | 26.45 |
| 44647.510416666664 | 25.93 |
| 44647.520833333336 | 25.21 |
| 44647.53125 | 25.36 |
| 44647.541666666664 | 24.86 |
| 44647.552083333336 | 24.32 |
| 44647.5625 | 23.94 |
| 44647.572916666664 | 23.36 |
| 44647.583333333336 | 22.63 |
| 44647.59375 | 22.21 |
| 44647.604166666664 | 21.82 |
| 44647.614583333336 | 21.48 |
| 44647.625 | 21.23 |
| 44647.635416666664 | 20.97 |
| 44647.645833333336 | 20.8 |
| 44647.65625 | 20.82 |
| 44647.666666666664 | 20.84 |
| 44647.677083333336 | 21.09 |
| 44647.6875 | 21.21 |
| 44647.697916666664 | 21.67 |
| 44647.708333333336 | 23.42 |
| 44647.71875 | 24.43 |
| 44647.729166666664 | 24.8 |
| 44647.739583333336 | 25.12 |
| 44647.75 | 25.26 |
| 44647.760416666664 | 25.57 |
| 44647.770833333336 | 26.01 |
| 44647.78125 | 26.44 |
| 44647.791666666664 | 26.77 |
| 44647.802083333336 | 27.09 |
| 44647.8125 | 27.18 |
| 44647.822916666664 | 27.3 |
| 44647.833333333336 | 27.58 |
| 44647.84375 | 27.86 |
| 44647.854166666664 | 28 |
| 44647.864583333336 | 28.17 |
| 44647.875 | 28.39 |
| 44647.885416666664 | 28.48 |
| 44647.895833333336 | 28.61 |
| 44647.90625 | 28.71 |
| 44647.916666666664 | 28.77 |
| 44647.927083333336 | 28.87 |
| 44647.9375 | 29 |
| 44647.947916666664 | 28.86 |
| 44647.958333333336 | 28.69 |
| 44647.96875 | 28.6 |
| 44647.979166666664 | 28.41 |
| 44647.989583333336 | 27.13 |
| 44648.0 | 27.53 |
| 44648.010416666664 | 27.28 |
| 44648.020833333336 | 26.84 |
| 44648.03125 | 25.79 |
| 44648.041666666664 | 26.25 |
| 44648.052083333336 | 25.89 |
| 44648.0625 | 25.37 |
| 44648.072916666664 | 24.53 |
| 44648.083333333336 | 23.86 |
| 44648.09375 | 23.33 |
| 44648.104166666664 | 22.69 |
| 44648.114583333336 | 22.09 |
| 44648.125 | 21.59 |
| 44648.135416666664 | 21.18 |
| 44648.145833333336 | 21.22 |
| 44648.15625 | 20.78 |
| 44648.166666666664 | 20.69 |
| 44648.177083333336 | 20.68 |
| 44648.1875 | 21 |
| 44648.197916666664 | 21.05 |
| 44648.208333333336 | 21.47 |
| 44648.21875 | 23.24 |
| 44648.229166666664 | 24.75 |
| 44648.239583333336 | 25.37 |
| 44648.25 | 25.77 |
| 44648.260416666664 | 25.85 |
| 44648.270833333336 | 25.88 |
| 44648.28125 | 25.84 |
| 44648.291666666664 | 25.84 |
| 44648.302083333336 | 26.04 |
| 44648.3125 | 26.31 |
| 44648.322916666664 | 26.66 |
| 44648.333333333336 | 27 |
| 44648.34375 | 27.44 |
| 44648.354166666664 | 27.69 |
| 44648.364583333336 | 28.12 |
| 44648.375 | 28.76 |
| 44648.385416666664 | 29.01 |
| 44648.395833333336 | 29.11 |
| 44648.40625 | 29.16 |
| 44648.416666666664 | 29.18 |
| 44648.427083333336 | 29.18 |
| 44648.4375 | 29.2 |
| 44648.447916666664 | 29.2 |
| 44648.458333333336 | 29.21 |
| 44648.46875 | 29.23 |
| 44648.479166666664 | 29.2 |
| 44648.489583333336 | 29.17 |
| 44648.5 | 29.16 |
| 44648.510416666664 | 28.97 |
| 44648.520833333336 | 28.6 |
| 44648.53125 | 28.93 |
| 44648.541666666664 | 28.29 |
| 44648.552083333336 | 27.79 |
| 44648.5625 | 27.37 |
| 44648.572916666664 | 27.27 |
| 44648.583333333336 | 27.37 |
| 44648.59375 | 26.67 |
| 44648.604166666664 | 26.27 |
| 44648.614583333336 | 25.65 |
| 44648.625 | 24.99 |
| 44648.635416666664 | 24.51 |
| 44648.645833333336 | 24.2 |
| 44648.65625 | 23.84 |
| 44648.666666666664 | 23.65 |
| 44648.677083333336 | 23.43 |
| 44648.6875 | 23.41 |
| 44648.697916666664 | 23.49 |
| 44648.708333333336 | 23.7 |
| 44648.71875 | 23.81 |
| 44648.729166666664 | 23.92 |
| 44648.739583333336 | 24.28 |
| 44648.75 | 25.08 |
| 44648.760416666664 | 25.92 |
| 44648.770833333336 | 26.19 |
| 44648.78125 | 26.66 |
| 44648.791666666664 | 26.92 |
| 44648.802083333336 | 27.13 |
| 44648.8125 | 27.34 |
| 44648.822916666664 | 27.48 |
| 44648.833333333336 | 27.58 |
| 44648.84375 | 27.73 |
| 44648.854166666664 | 27.91 |
| 44648.864583333336 | 28.11 |
| 44648.875 | 28.31 |
| 44648.885416666664 | 28.52 |
| 44648.895833333336 | 28.71 |
| 44648.90625 | 29.1 |
| 44648.916666666664 | 29.31 |
| 44648.927083333336 | 29.45 |
| 44648.9375 | 29.5 |
| 44648.947916666664 | 29.57 |
| 44648.958333333336 | 29.57 |
| 44648.96875 | 29.53 |
| 44648.979166666664 | 29.48 |
| 44648.989583333336 | 29.32 |
| 44649.0 | 29.05 |
| 44649.010416666664 | 29.02 |
| 44649.020833333336 | 28.81 |
| 44649.03125 | 28.59 |
| 44649.041666666664 | 28.02 |
| 44649.052083333336 | 27.43 |
| 44649.0625 | 26.79 |
| 44649.072916666664 | 26.17 |
| 44649.083333333336 | 25.47 |
| 44649.09375 | 25.01 |
| 44649.104166666664 | 24.61 |
| 44649.114583333336 | 24.33 |
| 44649.125 | 23.99 |
| 44649.135416666664 | 23.9 |
| 44649.145833333336 | 23.81 |
| 44649.15625 | 23.84 |
| 44649.166666666664 | 23.85 |
| 44649.177083333336 | 23.85 |
| 44649.1875 | 23.84 |
| 44649.197916666664 | 23.88 |
| 44649.208333333336 | 23.92 |
| 44649.21875 | 23.88 |
| 44649.229166666664 | 23.85 |
| 44649.239583333336 | 23.94 |
| 44649.25 | 25.41 |
| 44649.260416666664 | 26.33 |
| 44649.270833333336 | 26.73 |
| 44649.28125 | 27.1 |
| 44649.291666666664 | 27.35 |
| 44649.302083333336 | 27.44 |
| 44649.3125 | 27.13 |
| 44649.322916666664 | 27.14 |
| 44649.333333333336 | 27.4 |
| 44649.34375 | 27.66 |
| 44649.354166666664 | 27.81 |
| 44649.364583333336 | 28.21 |
| 44649.375 | 28.57 |
| 44649.385416666664 | 28.79 |
| 44649.395833333336 | 29.04 |
| 44649.40625 | 29.34 |
| 44649.416666666664 | 29.58 |
| 44649.427083333336 | 29.73 |
| 44649.4375 | 29.83 |
| 44649.447916666664 | 29.88 |
| 44649.458333333336 | 29.9 |
| 44649.46875 | 29.89 |
| 44649.479166666664 | 29.89 |
| 44649.489583333336 | 29.89 |
| 44649.5 | 29.79 |
| 44649.510416666664 | 29.79 |
| 44649.520833333336 | 29.75 |
| 44649.53125 | 29.69 |
| 44649.541666666664 | 29.63 |
| 44649.552083333336 | 29.63 |
| 44649.5625 | 29.53 |
| 44649.572916666664 | 29.29 |
| 44649.583333333336 | 28.98 |
| 44649.59375 | 28.74 |
| 44649.604166666664 | 28.48 |
| 44649.614583333336 | 28.3 |
| 44649.625 | 27.47 |
| 44649.635416666664 | 27.05 |
| 44649.645833333336 | 26.67 |
| 44649.65625 | 26.3 |
| 44649.666666666664 | 25.85 |
| 44649.677083333336 | 25.63 |
| 44649.6875 | 25.27 |
| 44649.697916666664 | 24.94 |
| 44649.708333333336 | 24.76 |
| 44649.71875 | 24.68 |
| 44649.729166666664 | 24.65 |
| 44649.739583333336 | 24.66 |
| 44649.75 | 24.77 |
| 44649.760416666664 | 24.86 |
| 44649.770833333336 | 24.96 |
| 44649.78125 | 25.03 |
| 44649.791666666664 | 25.46 |
| 44649.802083333336 | 27.26 |
| 44649.8125 | 27.65 |
| 44649.822916666664 | 28.15 |
| 44649.833333333336 | 28.23 |
| 44649.84375 | 28.16 |
| 44649.854166666664 | 27.97 |
| 44649.864583333336 | 27.93 |
| 44649.875 | 28.08 |
| 44649.885416666664 | 28.27 |
| 44649.895833333336 | 28.42 |
| 44649.90625 | 28.58 |
| 44649.916666666664 | 28.72 |
| 44649.927083333336 | 29.01 |
| 44649.9375 | 29.41 |
| 44649.947916666664 | 29.67 |
| 44649.958333333336 | 29.84 |
| 44649.96875 | 29.95 |
| 44649.979166666664 | 30.01 |
| 44649.989583333336 | 30.04 |
| 44650.0 | 30.11 |
| 44650.010416666664 | 30.17 |
| 44650.020833333336 | 30.01 |
| 44650.03125 | 29.88 |
| 44650.041666666664 | 29.89 |
| 44650.052083333336 | 29.6 |
| 44650.0625 | 29.23 |
| 44650.072916666664 | 29.11 |
| 44650.083333333336 | 28.92 |
| 44650.09375 | 28.67 |
| 44650.104166666664 | 28.41 |
| 44650.114583333336 | 28.09 |
| 44650.125 | 27.79 |
| 44650.135416666664 | 27.45 |
| 44650.145833333336 | 26.89 |
| 44650.15625 | 26.49 |
| 44650.166666666664 | 26.22 |
| 44650.177083333336 | 25.91 |
| 44650.1875 | 25.7 |
| 44650.197916666664 | 25.5 |
| 44650.208333333336 | 25.39 |
| 44650.21875 | 25.38 |
| 44650.229166666664 | 25.4 |
| 44650.239583333336 | 25.43 |
| 44650.25 | 25.43 |
| 44650.260416666664 | 25.42 |
| 44650.270833333336 | 25.46 |
| 44650.28125 | 25.4 |
| 44650.291666666664 | 25.39 |
| 44650.302083333336 | 25.55 |
| 44650.3125 | 26.18 |
| 44650.322916666664 | 26.83 |
| 44650.333333333336 | 27.26 |
| 44650.34375 | 27.72 |
| 44650.354166666664 | 27.96 |
| 44650.364583333336 | 28.21 |
| 44650.375 | 28.45 |
| 44650.385416666664 | 28.75 |
| 44650.395833333336 | 28.97 |
| 44650.40625 | 29.26 |
| 44650.416666666664 | 29.53 |
| 44650.427083333336 | 29.79 |
| 44650.4375 | 30.04 |
| 44650.447916666664 | 30.23 |
| 44650.458333333336 | 30.33 |
| 44650.46875 | 30.38 |
| 44650.479166666664 | 30.4 |
| 44650.489583333336 | 30.43 |
| 44650.5 | 30.44 |
| 44650.510416666664 | 30.45 |
| 44650.520833333336 | 30.43 |
| 44650.53125 | 30.31 |
| 44650.541666666664 | 30.25 |
| 44650.552083333336 | 30.22 |
| 44650.5625 | 30.09 |
| 44650.572916666664 | 30.04 |
| 44650.583333333336 | 29.95 |
| 44650.59375 | 30.03 |
| 44650.604166666664 | 29.76 |
| 44650.614583333336 | 29.5 |
| 44650.625 | 29.32 |
| 44650.635416666664 | 29.15 |
| 44650.645833333336 | 28.84 |
| 44650.65625 | 28.43 |
| 44650.666666666664 | 28.01 |
| 44650.677083333336 | 27.74 |
| 44650.6875 | 27.49 |
| 44650.697916666664 | 27.22 |
| 44650.708333333336 | 26.99 |
| 44650.71875 | 26.73 |
| 44650.729166666664 | 26.53 |
| 44650.739583333336 | 26.35 |
| 44650.75 | 26.22 |
| 44650.760416666664 | 26.17 |
| 44650.770833333336 | 26.17 |
| 44650.78125 | 26.29 |
| 44650.791666666664 | 26.35 |
| 44650.802083333336 | 26.44 |
| 44650.8125 | 26.73 |
| 44650.822916666664 | 27.09 |
| 44650.833333333336 | 27.67 |
| 44650.84375 | 28.24 |
| 44650.854166666664 | 28.6 |
| 44650.864583333336 | 28.85 |
| 44650.875 | 29.03 |
| 44650.885416666664 | 29.28 |
| 44650.895833333336 | 29.51 |
| 44650.90625 | 29.77 |
| 44650.916666666664 | 29.98 |
| 44650.927083333336 | 30.11 |
| 44650.9375 | 30.21 |
| 44650.947916666664 | 30.32 |
| 44650.958333333336 | 30.44 |
| 44650.96875 | 30.52 |
| 44650.979166666664 | 30.57 |
| 44650.989583333336 | 30.6 |
| 44651.0 | 30.58 |
| 44651.010416666664 | 30.57 |
| 44651.020833333336 | 30.52 |
| 44651.03125 | 30.51 |
| 44651.041666666664 | 30.52 |
| 44651.052083333336 | 30.42 |
| 44651.0625 | 30.37 |
| 44651.072916666664 | 30.32 |
| 44651.083333333336 | 30.23 |
| 44651.09375 | 30.31 |
| 44651.104166666664 | 30.16 |
| 44651.114583333336 | 30.19 |
| 44651.125 | 30.07 |
| 44651.135416666664 | 29.78 |
| 44651.145833333336 | 29.67 |
| 44651.15625 | 29.58 |
| 44651.166666666664 | 29.47 |
| 44651.177083333336 | 29.01 |
| 44651.1875 | 28.68 |
| 44651.197916666664 | 28.31 |
| 44651.208333333336 | 27.98 |
| 44651.21875 | 27.67 |
| 44651.229166666664 | 27.34 |
| 44651.239583333336 | 27.08 |
| 44651.25 | 26.86 |
| 44651.260416666664 | 26.59 |
| 44651.270833333336 | 26.46 |
| 44651.28125 | 26.41 |
| 44651.291666666664 | 26.38 |
| 44651.302083333336 | 26.35 |
| 44651.3125 | 26.53 |
| 44651.322916666664 | 26.52 |
| 44651.333333333336 | 26.67 |
| 44651.34375 | 26.95 |
| 44651.354166666664 | 27.55 |
| 44651.364583333336 | 28.5 |
| 44651.375 | 28.87 |
| 44651.385416666664 | 28.99 |
| 44651.395833333336 | 29.2 |
| 44651.40625 | 29.43 |
| 44651.416666666664 | 29.67 |
| 44651.427083333336 | 29.82 |
| 44651.4375 | 29.98 |
| 44651.447916666664 | 30.03 |
| 44651.458333333336 | 30.1 |
| 44651.46875 | 30.2 |
| 44651.479166666664 | 30.3 |
| 44651.489583333336 | 30.35 |
| 44651.5 | 30.38 |
| 44651.510416666664 | 30.41 |
| 44651.520833333336 | 30.42 |
| 44651.53125 | 30.44 |
| 44651.541666666664 | 30.45 |
| 44651.552083333336 | 30.46 |
| 44651.5625 | 30.47 |
| 44651.572916666664 | 30.36 |
| 44651.583333333336 | 30.37 |
| 44651.59375 | 30.23 |
| 44651.604166666664 | 30.32 |
| 44651.614583333336 | 30.21 |
| 44651.625 | 30.02 |
| 44651.635416666664 | 29.97 |
| 44651.645833333336 | 29.82 |
| 44651.65625 | 29.69 |
| 44651.666666666664 | 29.63 |
| 44651.677083333336 | 29.57 |
| 44651.6875 | 29.28 |
| 44651.697916666664 | 28.81 |
| 44651.708333333336 | 28.55 |
| 44651.71875 | 28.33 |
| 44651.729166666664 | 28.17 |
| 44651.739583333336 | 28.02 |
| 44651.75 | 27.87 |
| 44651.760416666664 | 27.73 |
| 44651.770833333336 | 27.63 |
| 44651.78125 | 27.57 |
| 44651.791666666664 | 27.52 |
| 44651.802083333336 | 27.54 |
| 44651.8125 | 27.6 |
| 44651.822916666664 | 27.73 |
| 44651.833333333336 | 27.77 |
| 44651.84375 | 27.91 |
| 44651.854166666664 | 28.43 |
| 44651.864583333336 | 28.95 |
| 44651.875 | 29.38 |
| 44651.885416666664 | 29.61 |
| 44651.895833333336 | 29.73 |
| 44651.90625 | 29.8 |
| 44651.916666666664 | 29.87 |
| 44651.927083333336 | 29.94 |
| 44651.9375 | 29.95 |
| 44651.947916666664 | 29.95 |
| 44651.958333333336 | 30.02 |
| 44651.96875 | 30.06 |
| 44651.979166666664 | 30.13 |
| 44651.989583333336 | 30.17 |
| 44652.0 | 30.21 |
| 44652.010416666664 | 30.26 |
| 44652.020833333336 | 30.31 |
| 44652.03125 | 30.35 |
| 44652.041666666664 | 30.38 |
| 44652.052083333336 | 30.37 |
| 44652.0625 | 30.25 |
| 44652.072916666664 | 30.22 |
| 44652.083333333336 | 30.13 |
| 44652.09375 | 30.19 |
| 44652.104166666664 | 30.26 |
| 44652.114583333336 | 30.11 |
| 44652.125 | 30.06 |
| 44652.135416666664 | 29.86 |
| 44652.145833333336 | 29.85 |